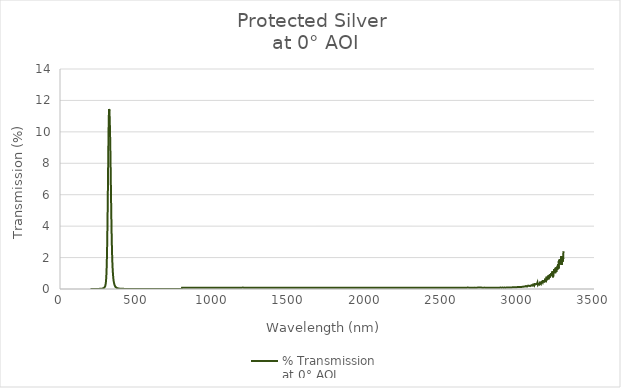
| Category | % Transmission 
at 0° AOI |
|---|---|
| 200.0 | 0 |
| 201.0 | 0 |
| 202.0 | 0.001 |
| 203.0 | 0.001 |
| 204.0 | 0.001 |
| 205.0 | 0.001 |
| 206.0 | 0.001 |
| 207.0 | 0.001 |
| 208.0 | 0.001 |
| 209.0 | 0.001 |
| 210.0 | 0.001 |
| 211.0 | 0.001 |
| 212.0 | 0.002 |
| 213.0 | 0.001 |
| 214.0 | 0.002 |
| 215.0 | 0.001 |
| 216.0 | 0.002 |
| 217.0 | 0.002 |
| 218.0 | 0.002 |
| 219.0 | 0.002 |
| 220.0 | 0.002 |
| 221.0 | 0.002 |
| 222.0 | 0.002 |
| 223.0 | 0.002 |
| 224.0 | 0.002 |
| 225.0 | 0.002 |
| 226.0 | 0.003 |
| 227.0 | 0.003 |
| 228.0 | 0.003 |
| 229.0 | 0.002 |
| 230.0 | 0.003 |
| 231.0 | 0.003 |
| 232.0 | 0.003 |
| 233.0 | 0.003 |
| 234.0 | 0.003 |
| 235.0 | 0.003 |
| 236.0 | 0.003 |
| 237.0 | 0.004 |
| 238.0 | 0.003 |
| 239.0 | 0.004 |
| 240.0 | 0.004 |
| 241.0 | 0.004 |
| 242.0 | 0.004 |
| 243.0 | 0.004 |
| 244.0 | 0.005 |
| 245.0 | 0.005 |
| 246.0 | 0.005 |
| 247.0 | 0.005 |
| 248.0 | 0.005 |
| 249.0 | 0.006 |
| 250.0 | 0.006 |
| 251.0 | 0.006 |
| 252.0 | 0.006 |
| 253.0 | 0.006 |
| 254.0 | 0.007 |
| 255.0 | 0.007 |
| 256.0 | 0.007 |
| 257.0 | 0.008 |
| 258.0 | 0.008 |
| 259.0 | 0.009 |
| 260.0 | 0.009 |
| 261.0 | 0.01 |
| 262.0 | 0.01 |
| 263.0 | 0.011 |
| 264.0 | 0.011 |
| 265.0 | 0.012 |
| 266.0 | 0.013 |
| 267.0 | 0.013 |
| 268.0 | 0.014 |
| 269.0 | 0.015 |
| 270.0 | 0.016 |
| 271.0 | 0.017 |
| 272.0 | 0.019 |
| 273.0 | 0.02 |
| 274.0 | 0.021 |
| 275.0 | 0.023 |
| 276.0 | 0.025 |
| 277.0 | 0.027 |
| 278.0 | 0.029 |
| 279.0 | 0.031 |
| 280.0 | 0.034 |
| 281.0 | 0.037 |
| 282.0 | 0.04 |
| 283.0 | 0.044 |
| 284.0 | 0.048 |
| 285.0 | 0.052 |
| 286.0 | 0.058 |
| 287.0 | 0.064 |
| 288.0 | 0.07 |
| 289.0 | 0.077 |
| 290.0 | 0.085 |
| 291.0 | 0.094 |
| 292.0 | 0.106 |
| 293.0 | 0.119 |
| 294.0 | 0.135 |
| 295.0 | 0.154 |
| 296.0 | 0.178 |
| 297.0 | 0.209 |
| 298.0 | 0.249 |
| 299.0 | 0.301 |
| 300.0 | 0.369 |
| 301.0 | 0.456 |
| 302.0 | 0.569 |
| 303.0 | 0.716 |
| 304.0 | 0.902 |
| 305.0 | 1.136 |
| 306.0 | 1.433 |
| 307.0 | 1.796 |
| 308.0 | 2.226 |
| 309.0 | 2.737 |
| 310.0 | 3.327 |
| 311.0 | 4.005 |
| 312.0 | 4.747 |
| 313.0 | 5.559 |
| 314.0 | 6.417 |
| 315.0 | 7.318 |
| 316.0 | 8.203 |
| 317.0 | 9.057 |
| 318.0 | 9.821 |
| 319.0 | 10.466 |
| 320.0 | 10.959 |
| 321.0 | 11.284 |
| 322.0 | 11.456 |
| 323.0 | 11.449 |
| 324.0 | 11.323 |
| 325.0 | 11.08 |
| 326.0 | 10.757 |
| 327.0 | 10.386 |
| 328.0 | 9.944 |
| 329.0 | 9.456 |
| 330.0 | 8.911 |
| 331.0 | 8.296 |
| 332.0 | 7.621 |
| 333.0 | 6.944 |
| 334.0 | 6.252 |
| 335.0 | 5.558 |
| 336.0 | 4.902 |
| 337.0 | 4.295 |
| 338.0 | 3.727 |
| 339.0 | 3.218 |
| 340.0 | 2.785 |
| 341.0 | 2.395 |
| 342.0 | 2.057 |
| 343.0 | 1.765 |
| 344.0 | 1.52 |
| 345.0 | 1.31 |
| 346.0 | 1.131 |
| 347.0 | 0.98 |
| 348.0 | 0.851 |
| 349.0 | 0.734 |
| 350.0 | 0.641 |
| 351.0 | 0.562 |
| 352.0 | 0.493 |
| 353.0 | 0.435 |
| 354.0 | 0.383 |
| 355.0 | 0.341 |
| 356.0 | 0.302 |
| 357.0 | 0.269 |
| 358.0 | 0.242 |
| 359.0 | 0.217 |
| 360.0 | 0.194 |
| 361.0 | 0.176 |
| 362.0 | 0.158 |
| 363.0 | 0.144 |
| 364.0 | 0.132 |
| 365.0 | 0.12 |
| 366.0 | 0.11 |
| 367.0 | 0.101 |
| 368.0 | 0.092 |
| 369.0 | 0.085 |
| 370.0 | 0.079 |
| 371.0 | 0.073 |
| 372.0 | 0.068 |
| 373.0 | 0.062 |
| 374.0 | 0.058 |
| 375.0 | 0.055 |
| 376.0 | 0.051 |
| 377.0 | 0.048 |
| 378.0 | 0.045 |
| 379.0 | 0.042 |
| 380.0 | 0.04 |
| 381.0 | 0.037 |
| 382.0 | 0.035 |
| 383.0 | 0.033 |
| 384.0 | 0.032 |
| 385.0 | 0.03 |
| 386.0 | 0.028 |
| 387.0 | 0.027 |
| 388.0 | 0.026 |
| 389.0 | 0.024 |
| 390.0 | 0.023 |
| 391.0 | 0.022 |
| 392.0 | 0.021 |
| 393.0 | 0.021 |
| 394.0 | 0.019 |
| 395.0 | 0.019 |
| 396.0 | 0.018 |
| 397.0 | 0.017 |
| 398.0 | 0.016 |
| 399.0 | 0.016 |
| 400.0 | 0.015 |
| 401.0 | 0.015 |
| 402.0 | 0.014 |
| 403.0 | 0.014 |
| 404.0 | 0.013 |
| 405.0 | 0.013 |
| 406.0 | 0.012 |
| 407.0 | 0.012 |
| 408.0 | 0.011 |
| 409.0 | 0.011 |
| 410.0 | 0.011 |
| 411.0 | 0.01 |
| 412.0 | 0.01 |
| 413.0 | 0.01 |
| 414.0 | 0.01 |
| 415.0 | 0.009 |
| 416.0 | 0.009 |
| 417.0 | 0.009 |
| 418.0 | 0.008 |
| 419.0 | 0.008 |
| 420.0 | 0.008 |
| 421.0 | 0.008 |
| 422.0 | 0.007 |
| 423.0 | 0.007 |
| 424.0 | 0.007 |
| 425.0 | 0.007 |
| 426.0 | 0.007 |
| 427.0 | 0.006 |
| 428.0 | 0.006 |
| 429.0 | 0.006 |
| 430.0 | 0.006 |
| 431.0 | 0.006 |
| 432.0 | 0.006 |
| 433.0 | 0.005 |
| 434.0 | 0.005 |
| 435.0 | 0.005 |
| 436.0 | 0.005 |
| 437.0 | 0.005 |
| 438.0 | 0.005 |
| 439.0 | 0.005 |
| 440.0 | 0.004 |
| 441.0 | 0.004 |
| 442.0 | 0.004 |
| 443.0 | 0.004 |
| 444.0 | 0.004 |
| 445.0 | 0.004 |
| 446.0 | 0.004 |
| 447.0 | 0.004 |
| 448.0 | 0.004 |
| 449.0 | 0.004 |
| 450.0 | 0.004 |
| 451.0 | 0.003 |
| 452.0 | 0.003 |
| 453.0 | 0.003 |
| 454.0 | 0.003 |
| 455.0 | 0.003 |
| 456.0 | 0.003 |
| 457.0 | 0.003 |
| 458.0 | 0.003 |
| 459.0 | 0.003 |
| 460.0 | 0.003 |
| 461.0 | 0.003 |
| 462.0 | 0.003 |
| 463.0 | 0.003 |
| 464.0 | 0.003 |
| 465.0 | 0.003 |
| 466.0 | 0.003 |
| 467.0 | 0.003 |
| 468.0 | 0.003 |
| 469.0 | 0.003 |
| 470.0 | 0.002 |
| 471.0 | 0.002 |
| 472.0 | 0.003 |
| 473.0 | 0.002 |
| 474.0 | 0.002 |
| 475.0 | 0.002 |
| 476.0 | 0.002 |
| 477.0 | 0.002 |
| 478.0 | 0.002 |
| 479.0 | 0.002 |
| 480.0 | 0.002 |
| 481.0 | 0.002 |
| 482.0 | 0.002 |
| 483.0 | 0.002 |
| 484.0 | 0.002 |
| 485.0 | 0.002 |
| 486.0 | 0.002 |
| 487.0 | 0.002 |
| 488.0 | 0.002 |
| 489.0 | 0.002 |
| 490.0 | 0.002 |
| 491.0 | 0.002 |
| 492.0 | 0.002 |
| 493.0 | 0.002 |
| 494.0 | 0.002 |
| 495.0 | 0.002 |
| 496.0 | 0.002 |
| 497.0 | 0.002 |
| 498.0 | 0.002 |
| 499.0 | 0.002 |
| 500.0 | 0.002 |
| 501.0 | 0.002 |
| 502.0 | 0.002 |
| 503.0 | 0.002 |
| 504.0 | 0.002 |
| 505.0 | 0.002 |
| 506.0 | 0.002 |
| 507.0 | 0.002 |
| 508.0 | 0.002 |
| 509.0 | 0.002 |
| 510.0 | 0.002 |
| 511.0 | 0.001 |
| 512.0 | 0.002 |
| 513.0 | 0.002 |
| 514.0 | 0.002 |
| 515.0 | 0.001 |
| 516.0 | 0.001 |
| 517.0 | 0.002 |
| 518.0 | 0.001 |
| 519.0 | 0.001 |
| 520.0 | 0.001 |
| 521.0 | 0.001 |
| 522.0 | 0.001 |
| 523.0 | 0.001 |
| 524.0 | 0.001 |
| 525.0 | 0.001 |
| 526.0 | 0.001 |
| 527.0 | 0.001 |
| 528.0 | 0.001 |
| 529.0 | 0.001 |
| 530.0 | 0.001 |
| 531.0 | 0.001 |
| 532.0 | 0.001 |
| 533.0 | 0.001 |
| 534.0 | 0.001 |
| 535.0 | 0.001 |
| 536.0 | 0.001 |
| 537.0 | 0.001 |
| 538.0 | 0.001 |
| 539.0 | 0.001 |
| 540.0 | 0.001 |
| 541.0 | 0.001 |
| 542.0 | 0.001 |
| 543.0 | 0.002 |
| 544.0 | 0.001 |
| 545.0 | 0.001 |
| 546.0 | 0.001 |
| 547.0 | 0.001 |
| 548.0 | 0.001 |
| 549.0 | 0.001 |
| 550.0 | 0.001 |
| 551.0 | 0.001 |
| 552.0 | 0.001 |
| 553.0 | 0.001 |
| 554.0 | 0.001 |
| 555.0 | 0.001 |
| 556.0 | 0.001 |
| 557.0 | 0.001 |
| 558.0 | 0.001 |
| 559.0 | 0.001 |
| 560.0 | 0.001 |
| 561.0 | 0.001 |
| 562.0 | 0.001 |
| 563.0 | 0.001 |
| 564.0 | 0.001 |
| 565.0 | 0.001 |
| 566.0 | 0.001 |
| 567.0 | 0.001 |
| 568.0 | 0.001 |
| 569.0 | 0.001 |
| 570.0 | 0.001 |
| 571.0 | 0.001 |
| 572.0 | 0.001 |
| 573.0 | 0.001 |
| 574.0 | 0.001 |
| 575.0 | 0.001 |
| 576.0 | 0.001 |
| 577.0 | 0.001 |
| 578.0 | 0.001 |
| 579.0 | 0.001 |
| 580.0 | 0.001 |
| 581.0 | 0.001 |
| 582.0 | 0.001 |
| 583.0 | 0.001 |
| 584.0 | 0.001 |
| 585.0 | 0.001 |
| 586.0 | 0.001 |
| 587.0 | 0.001 |
| 588.0 | 0.001 |
| 589.0 | 0.001 |
| 590.0 | 0.001 |
| 591.0 | 0.001 |
| 592.0 | 0.001 |
| 593.0 | 0.001 |
| 594.0 | 0.001 |
| 595.0 | 0.001 |
| 596.0 | 0 |
| 597.0 | 0.001 |
| 598.0 | 0 |
| 599.0 | 0.001 |
| 600.0 | 0.001 |
| 601.0 | 0.001 |
| 602.0 | 0 |
| 603.0 | 0.001 |
| 604.0 | 0.001 |
| 605.0 | 0.001 |
| 606.0 | 0.001 |
| 607.0 | 0.001 |
| 608.0 | 0.001 |
| 609.0 | 0.001 |
| 610.0 | 0.001 |
| 611.0 | 0.001 |
| 612.0 | 0.001 |
| 613.0 | 0.001 |
| 614.0 | 0.001 |
| 615.0 | 0.001 |
| 616.0 | 0.001 |
| 617.0 | 0.001 |
| 618.0 | 0.001 |
| 619.0 | 0.001 |
| 620.0 | 0.001 |
| 621.0 | 0.001 |
| 622.0 | 0.001 |
| 623.0 | 0.001 |
| 624.0 | 0.001 |
| 625.0 | 0.001 |
| 626.0 | 0.001 |
| 627.0 | 0.001 |
| 628.0 | 0.001 |
| 629.0 | 0.001 |
| 630.0 | 0.001 |
| 631.0 | 0.001 |
| 632.0 | 0.001 |
| 633.0 | 0.001 |
| 634.0 | 0 |
| 635.0 | 0 |
| 636.0 | 0.001 |
| 637.0 | 0 |
| 638.0 | 0 |
| 639.0 | 0.001 |
| 640.0 | 0.001 |
| 641.0 | 0.001 |
| 642.0 | 0.001 |
| 643.0 | 0 |
| 644.0 | 0 |
| 645.0 | 0.001 |
| 646.0 | 0.001 |
| 647.0 | 0.001 |
| 648.0 | 0 |
| 649.0 | 0.001 |
| 650.0 | 0.001 |
| 651.0 | 0.001 |
| 652.0 | 0.001 |
| 653.0 | 0.001 |
| 654.0 | 0.001 |
| 655.0 | 0.001 |
| 656.0 | 0.001 |
| 657.0 | 0.001 |
| 658.0 | 0.001 |
| 659.0 | 0.001 |
| 660.0 | 0.001 |
| 661.0 | 0.001 |
| 662.0 | 0.001 |
| 663.0 | 0.001 |
| 664.0 | 0 |
| 665.0 | 0.001 |
| 666.0 | 0.001 |
| 667.0 | 0.001 |
| 668.0 | 0.001 |
| 669.0 | 0.001 |
| 670.0 | 0 |
| 671.0 | 0.001 |
| 672.0 | 0.001 |
| 673.0 | 0.001 |
| 674.0 | 0.001 |
| 675.0 | 0.001 |
| 676.0 | 0 |
| 677.0 | 0.001 |
| 678.0 | 0.001 |
| 679.0 | 0.001 |
| 680.0 | 0.001 |
| 681.0 | 0.001 |
| 682.0 | 0 |
| 683.0 | 0.001 |
| 684.0 | 0.001 |
| 685.0 | 0.001 |
| 686.0 | 0.001 |
| 687.0 | 0.001 |
| 688.0 | 0.001 |
| 689.0 | 0.001 |
| 690.0 | 0.001 |
| 691.0 | 0.001 |
| 692.0 | 0.001 |
| 693.0 | 0.001 |
| 694.0 | 0.001 |
| 695.0 | 0.001 |
| 696.0 | 0.001 |
| 697.0 | 0.001 |
| 698.0 | 0.001 |
| 699.0 | 0.001 |
| 700.0 | 0.001 |
| 701.0 | 0.001 |
| 702.0 | 0.001 |
| 703.0 | 0.001 |
| 704.0 | 0.001 |
| 705.0 | 0.001 |
| 706.0 | 0.001 |
| 707.0 | 0.001 |
| 708.0 | 0.001 |
| 709.0 | 0.001 |
| 710.0 | 0.001 |
| 711.0 | 0.001 |
| 712.0 | 0.001 |
| 713.0 | 0.001 |
| 714.0 | 0.001 |
| 715.0 | 0.001 |
| 716.0 | 0.001 |
| 717.0 | 0.001 |
| 718.0 | 0.001 |
| 719.0 | 0.001 |
| 720.0 | 0.001 |
| 721.0 | 0.001 |
| 722.0 | 0.001 |
| 723.0 | 0.001 |
| 724.0 | 0.001 |
| 725.0 | 0.001 |
| 726.0 | 0.001 |
| 727.0 | 0.001 |
| 728.0 | 0.001 |
| 729.0 | 0.001 |
| 730.0 | 0.001 |
| 731.0 | 0.001 |
| 732.0 | 0.001 |
| 733.0 | 0.001 |
| 734.0 | 0.001 |
| 735.0 | 0.001 |
| 736.0 | 0.001 |
| 737.0 | 0.001 |
| 738.0 | 0.001 |
| 739.0 | 0.001 |
| 740.0 | 0.001 |
| 741.0 | 0.001 |
| 742.0 | 0.001 |
| 743.0 | 0.001 |
| 744.0 | 0.001 |
| 745.0 | 0.001 |
| 746.0 | 0.001 |
| 747.0 | 0.001 |
| 748.0 | 0.001 |
| 749.0 | 0.001 |
| 750.0 | 0.001 |
| 751.0 | 0.001 |
| 752.0 | 0.001 |
| 753.0 | 0.001 |
| 754.0 | 0.001 |
| 755.0 | 0.001 |
| 756.0 | 0.001 |
| 757.0 | 0.001 |
| 758.0 | 0.001 |
| 759.0 | 0.001 |
| 760.0 | 0.001 |
| 761.0 | 0.001 |
| 762.0 | 0.001 |
| 763.0 | 0.001 |
| 764.0 | 0.001 |
| 765.0 | 0.001 |
| 766.0 | 0.001 |
| 767.0 | 0.001 |
| 768.0 | 0.001 |
| 769.0 | 0.001 |
| 770.0 | 0.001 |
| 771.0 | 0.001 |
| 772.0 | 0.001 |
| 773.0 | 0.001 |
| 774.0 | 0.001 |
| 775.0 | 0.001 |
| 776.0 | 0.001 |
| 777.0 | 0.001 |
| 778.0 | 0.001 |
| 779.0 | 0.001 |
| 780.0 | 0.001 |
| 781.0 | 0.001 |
| 782.0 | 0.001 |
| 783.0 | 0.001 |
| 784.0 | 0.001 |
| 785.0 | 0.001 |
| 786.0 | 0.001 |
| 787.0 | 0.001 |
| 788.0 | 0.001 |
| 789.0 | 0.001 |
| 790.0 | 0.001 |
| 791.0 | 0.001 |
| 792.0 | 0.001 |
| 793.0 | 0.001 |
| 794.0 | 0.001 |
| 795.0 | 0.001 |
| 796.0 | 0.001 |
| 797.0 | 0.001 |
| 798.0 | 0.001 |
| 799.0 | 0 |
| 800.0 | 0.082 |
| 801.0 | 0.082 |
| 802.0 | 0.082 |
| 803.0 | 0.082 |
| 804.0 | 0.084 |
| 805.0 | 0.082 |
| 806.0 | 0.083 |
| 807.0 | 0.083 |
| 808.0 | 0.084 |
| 809.0 | 0.081 |
| 810.0 | 0.082 |
| 811.0 | 0.084 |
| 812.0 | 0.084 |
| 813.0 | 0.081 |
| 814.0 | 0.08 |
| 815.0 | 0.082 |
| 816.0 | 0.082 |
| 817.0 | 0.081 |
| 818.0 | 0.084 |
| 819.0 | 0.083 |
| 820.0 | 0.082 |
| 821.0 | 0.083 |
| 822.0 | 0.082 |
| 823.0 | 0.084 |
| 824.0 | 0.083 |
| 825.0 | 0.081 |
| 826.0 | 0.081 |
| 827.0 | 0.081 |
| 828.0 | 0.084 |
| 829.0 | 0.083 |
| 830.0 | 0.084 |
| 831.0 | 0.082 |
| 832.0 | 0.082 |
| 833.0 | 0.083 |
| 834.0 | 0.082 |
| 835.0 | 0.083 |
| 836.0 | 0.084 |
| 837.0 | 0.083 |
| 838.0 | 0.081 |
| 839.0 | 0.083 |
| 840.0 | 0.082 |
| 841.0 | 0.082 |
| 842.0 | 0.083 |
| 843.0 | 0.083 |
| 844.0 | 0.085 |
| 845.0 | 0.083 |
| 846.0 | 0.083 |
| 847.0 | 0.085 |
| 848.0 | 0.086 |
| 849.0 | 0.081 |
| 850.0 | 0.083 |
| 851.0 | 0.084 |
| 852.0 | 0.085 |
| 853.0 | 0.082 |
| 854.0 | 0.082 |
| 855.0 | 0.085 |
| 856.0 | 0.083 |
| 857.0 | 0.082 |
| 858.0 | 0.085 |
| 859.0 | 0.081 |
| 860.0 | 0.078 |
| 861.0 | 0.083 |
| 862.0 | 0.084 |
| 863.0 | 0.081 |
| 864.0 | 0.083 |
| 865.0 | 0.085 |
| 866.0 | 0.083 |
| 867.0 | 0.081 |
| 868.0 | 0.083 |
| 869.0 | 0.084 |
| 870.0 | 0.085 |
| 871.0 | 0.084 |
| 872.0 | 0.084 |
| 873.0 | 0.084 |
| 874.0 | 0.086 |
| 875.0 | 0.084 |
| 876.0 | 0.084 |
| 877.0 | 0.081 |
| 878.0 | 0.085 |
| 879.0 | 0.084 |
| 880.0 | 0.084 |
| 881.0 | 0.084 |
| 882.0 | 0.086 |
| 883.0 | 0.083 |
| 884.0 | 0.082 |
| 885.0 | 0.084 |
| 886.0 | 0.083 |
| 887.0 | 0.082 |
| 888.0 | 0.082 |
| 889.0 | 0.084 |
| 890.0 | 0.083 |
| 891.0 | 0.083 |
| 892.0 | 0.082 |
| 893.0 | 0.083 |
| 894.0 | 0.084 |
| 895.0 | 0.082 |
| 896.0 | 0.083 |
| 897.0 | 0.084 |
| 898.0 | 0.083 |
| 899.0 | 0.084 |
| 900.0 | 0.082 |
| 901.0 | 0.083 |
| 902.0 | 0.085 |
| 903.0 | 0.083 |
| 904.0 | 0.081 |
| 905.0 | 0.082 |
| 906.0 | 0.081 |
| 907.0 | 0.084 |
| 908.0 | 0.082 |
| 909.0 | 0.081 |
| 910.0 | 0.083 |
| 911.0 | 0.082 |
| 912.0 | 0.082 |
| 913.0 | 0.083 |
| 914.0 | 0.081 |
| 915.0 | 0.082 |
| 916.0 | 0.083 |
| 917.0 | 0.081 |
| 918.0 | 0.082 |
| 919.0 | 0.079 |
| 920.0 | 0.083 |
| 921.0 | 0.081 |
| 922.0 | 0.083 |
| 923.0 | 0.081 |
| 924.0 | 0.085 |
| 925.0 | 0.081 |
| 926.0 | 0.082 |
| 927.0 | 0.081 |
| 928.0 | 0.082 |
| 929.0 | 0.082 |
| 930.0 | 0.085 |
| 931.0 | 0.081 |
| 932.0 | 0.082 |
| 933.0 | 0.083 |
| 934.0 | 0.084 |
| 935.0 | 0.08 |
| 936.0 | 0.081 |
| 937.0 | 0.083 |
| 938.0 | 0.083 |
| 939.0 | 0.081 |
| 940.0 | 0.083 |
| 941.0 | 0.085 |
| 942.0 | 0.081 |
| 943.0 | 0.08 |
| 944.0 | 0.081 |
| 945.0 | 0.081 |
| 946.0 | 0.081 |
| 947.0 | 0.081 |
| 948.0 | 0.082 |
| 949.0 | 0.079 |
| 950.0 | 0.08 |
| 951.0 | 0.081 |
| 952.0 | 0.08 |
| 953.0 | 0.081 |
| 954.0 | 0.08 |
| 955.0 | 0.082 |
| 956.0 | 0.081 |
| 957.0 | 0.081 |
| 958.0 | 0.081 |
| 959.0 | 0.084 |
| 960.0 | 0.081 |
| 961.0 | 0.081 |
| 962.0 | 0.081 |
| 963.0 | 0.08 |
| 964.0 | 0.083 |
| 965.0 | 0.079 |
| 966.0 | 0.083 |
| 967.0 | 0.081 |
| 968.0 | 0.082 |
| 969.0 | 0.081 |
| 970.0 | 0.082 |
| 971.0 | 0.079 |
| 972.0 | 0.081 |
| 973.0 | 0.078 |
| 974.0 | 0.08 |
| 975.0 | 0.082 |
| 976.0 | 0.083 |
| 977.0 | 0.081 |
| 978.0 | 0.08 |
| 979.0 | 0.083 |
| 980.0 | 0.082 |
| 981.0 | 0.083 |
| 982.0 | 0.082 |
| 983.0 | 0.082 |
| 984.0 | 0.083 |
| 985.0 | 0.084 |
| 986.0 | 0.083 |
| 987.0 | 0.082 |
| 988.0 | 0.082 |
| 989.0 | 0.083 |
| 990.0 | 0.084 |
| 991.0 | 0.081 |
| 992.0 | 0.081 |
| 993.0 | 0.081 |
| 994.0 | 0.081 |
| 995.0 | 0.08 |
| 996.0 | 0.082 |
| 997.0 | 0.081 |
| 998.0 | 0.082 |
| 999.0 | 0.08 |
| 1000.0 | 0.078 |
| 1001.0 | 0.081 |
| 1002.0 | 0.081 |
| 1003.0 | 0.081 |
| 1004.0 | 0.082 |
| 1005.0 | 0.079 |
| 1006.0 | 0.083 |
| 1007.0 | 0.082 |
| 1008.0 | 0.083 |
| 1009.0 | 0.083 |
| 1010.0 | 0.082 |
| 1011.0 | 0.081 |
| 1012.0 | 0.082 |
| 1013.0 | 0.084 |
| 1014.0 | 0.083 |
| 1015.0 | 0.083 |
| 1016.0 | 0.082 |
| 1017.0 | 0.086 |
| 1018.0 | 0.082 |
| 1019.0 | 0.083 |
| 1020.0 | 0.08 |
| 1021.0 | 0.083 |
| 1022.0 | 0.084 |
| 1023.0 | 0.081 |
| 1024.0 | 0.081 |
| 1025.0 | 0.078 |
| 1026.0 | 0.082 |
| 1027.0 | 0.081 |
| 1028.0 | 0.081 |
| 1029.0 | 0.083 |
| 1030.0 | 0.082 |
| 1031.0 | 0.085 |
| 1032.0 | 0.083 |
| 1033.0 | 0.079 |
| 1034.0 | 0.083 |
| 1035.0 | 0.083 |
| 1036.0 | 0.08 |
| 1037.0 | 0.083 |
| 1038.0 | 0.082 |
| 1039.0 | 0.084 |
| 1040.0 | 0.082 |
| 1041.0 | 0.082 |
| 1042.0 | 0.082 |
| 1043.0 | 0.082 |
| 1044.0 | 0.082 |
| 1045.0 | 0.084 |
| 1046.0 | 0.082 |
| 1047.0 | 0.083 |
| 1048.0 | 0.081 |
| 1049.0 | 0.083 |
| 1050.0 | 0.082 |
| 1051.0 | 0.081 |
| 1052.0 | 0.081 |
| 1053.0 | 0.086 |
| 1054.0 | 0.082 |
| 1055.0 | 0.08 |
| 1056.0 | 0.083 |
| 1057.0 | 0.084 |
| 1058.0 | 0.08 |
| 1059.0 | 0.084 |
| 1060.0 | 0.081 |
| 1061.0 | 0.084 |
| 1062.0 | 0.08 |
| 1063.0 | 0.082 |
| 1064.0 | 0.078 |
| 1065.0 | 0.082 |
| 1066.0 | 0.081 |
| 1067.0 | 0.086 |
| 1068.0 | 0.084 |
| 1069.0 | 0.08 |
| 1070.0 | 0.082 |
| 1071.0 | 0.083 |
| 1072.0 | 0.079 |
| 1073.0 | 0.081 |
| 1074.0 | 0.082 |
| 1075.0 | 0.081 |
| 1076.0 | 0.083 |
| 1077.0 | 0.083 |
| 1078.0 | 0.082 |
| 1079.0 | 0.079 |
| 1080.0 | 0.081 |
| 1081.0 | 0.081 |
| 1082.0 | 0.082 |
| 1083.0 | 0.08 |
| 1084.0 | 0.081 |
| 1085.0 | 0.082 |
| 1086.0 | 0.08 |
| 1087.0 | 0.081 |
| 1088.0 | 0.082 |
| 1089.0 | 0.083 |
| 1090.0 | 0.079 |
| 1091.0 | 0.081 |
| 1092.0 | 0.084 |
| 1093.0 | 0.081 |
| 1094.0 | 0.081 |
| 1095.0 | 0.082 |
| 1096.0 | 0.081 |
| 1097.0 | 0.08 |
| 1098.0 | 0.082 |
| 1099.0 | 0.081 |
| 1100.0 | 0.081 |
| 1101.0 | 0.083 |
| 1102.0 | 0.085 |
| 1103.0 | 0.083 |
| 1104.0 | 0.082 |
| 1105.0 | 0.084 |
| 1106.0 | 0.079 |
| 1107.0 | 0.082 |
| 1108.0 | 0.08 |
| 1109.0 | 0.08 |
| 1110.0 | 0.083 |
| 1111.0 | 0.081 |
| 1112.0 | 0.083 |
| 1113.0 | 0.083 |
| 1114.0 | 0.083 |
| 1115.0 | 0.081 |
| 1116.0 | 0.082 |
| 1117.0 | 0.082 |
| 1118.0 | 0.082 |
| 1119.0 | 0.081 |
| 1120.0 | 0.081 |
| 1121.0 | 0.081 |
| 1122.0 | 0.08 |
| 1123.0 | 0.081 |
| 1124.0 | 0.082 |
| 1125.0 | 0.083 |
| 1126.0 | 0.082 |
| 1127.0 | 0.081 |
| 1128.0 | 0.083 |
| 1129.0 | 0.081 |
| 1130.0 | 0.083 |
| 1131.0 | 0.08 |
| 1132.0 | 0.078 |
| 1133.0 | 0.082 |
| 1134.0 | 0.083 |
| 1135.0 | 0.081 |
| 1136.0 | 0.083 |
| 1137.0 | 0.081 |
| 1138.0 | 0.082 |
| 1139.0 | 0.082 |
| 1140.0 | 0.082 |
| 1141.0 | 0.083 |
| 1142.0 | 0.082 |
| 1143.0 | 0.084 |
| 1144.0 | 0.082 |
| 1145.0 | 0.079 |
| 1146.0 | 0.082 |
| 1147.0 | 0.083 |
| 1148.0 | 0.081 |
| 1149.0 | 0.082 |
| 1150.0 | 0.08 |
| 1151.0 | 0.082 |
| 1152.0 | 0.082 |
| 1153.0 | 0.082 |
| 1154.0 | 0.082 |
| 1155.0 | 0.084 |
| 1156.0 | 0.082 |
| 1157.0 | 0.079 |
| 1158.0 | 0.082 |
| 1159.0 | 0.084 |
| 1160.0 | 0.081 |
| 1161.0 | 0.08 |
| 1162.0 | 0.081 |
| 1163.0 | 0.08 |
| 1164.0 | 0.082 |
| 1165.0 | 0.082 |
| 1166.0 | 0.083 |
| 1167.0 | 0.079 |
| 1168.0 | 0.083 |
| 1169.0 | 0.083 |
| 1170.0 | 0.08 |
| 1171.0 | 0.08 |
| 1172.0 | 0.081 |
| 1173.0 | 0.082 |
| 1174.0 | 0.08 |
| 1175.0 | 0.082 |
| 1176.0 | 0.079 |
| 1177.0 | 0.081 |
| 1178.0 | 0.086 |
| 1179.0 | 0.084 |
| 1180.0 | 0.081 |
| 1181.0 | 0.082 |
| 1182.0 | 0.082 |
| 1183.0 | 0.081 |
| 1184.0 | 0.081 |
| 1185.0 | 0.083 |
| 1186.0 | 0.083 |
| 1187.0 | 0.083 |
| 1188.0 | 0.081 |
| 1189.0 | 0.083 |
| 1190.0 | 0.082 |
| 1191.0 | 0.082 |
| 1192.0 | 0.086 |
| 1193.0 | 0.08 |
| 1194.0 | 0.082 |
| 1195.0 | 0.084 |
| 1196.0 | 0.085 |
| 1197.0 | 0.086 |
| 1198.0 | 0.085 |
| 1199.0 | 0.09 |
| 1200.0 | 0.081 |
| 1201.0 | 0.083 |
| 1202.0 | 0.081 |
| 1203.0 | 0.083 |
| 1204.0 | 0.083 |
| 1205.0 | 0.08 |
| 1206.0 | 0.083 |
| 1207.0 | 0.085 |
| 1208.0 | 0.083 |
| 1209.0 | 0.083 |
| 1210.0 | 0.083 |
| 1211.0 | 0.084 |
| 1212.0 | 0.081 |
| 1213.0 | 0.08 |
| 1214.0 | 0.08 |
| 1215.0 | 0.079 |
| 1216.0 | 0.081 |
| 1217.0 | 0.082 |
| 1218.0 | 0.082 |
| 1219.0 | 0.083 |
| 1220.0 | 0.083 |
| 1221.0 | 0.079 |
| 1222.0 | 0.08 |
| 1223.0 | 0.083 |
| 1224.0 | 0.083 |
| 1225.0 | 0.083 |
| 1226.0 | 0.083 |
| 1227.0 | 0.081 |
| 1228.0 | 0.081 |
| 1229.0 | 0.084 |
| 1230.0 | 0.08 |
| 1231.0 | 0.081 |
| 1232.0 | 0.082 |
| 1233.0 | 0.084 |
| 1234.0 | 0.083 |
| 1235.0 | 0.083 |
| 1236.0 | 0.083 |
| 1237.0 | 0.081 |
| 1238.0 | 0.083 |
| 1239.0 | 0.081 |
| 1240.0 | 0.081 |
| 1241.0 | 0.082 |
| 1242.0 | 0.082 |
| 1243.0 | 0.084 |
| 1244.0 | 0.081 |
| 1245.0 | 0.081 |
| 1246.0 | 0.083 |
| 1247.0 | 0.081 |
| 1248.0 | 0.083 |
| 1249.0 | 0.082 |
| 1250.0 | 0.082 |
| 1251.0 | 0.081 |
| 1252.0 | 0.082 |
| 1253.0 | 0.083 |
| 1254.0 | 0.083 |
| 1255.0 | 0.083 |
| 1256.0 | 0.082 |
| 1257.0 | 0.082 |
| 1258.0 | 0.081 |
| 1259.0 | 0.083 |
| 1260.0 | 0.082 |
| 1261.0 | 0.084 |
| 1262.0 | 0.082 |
| 1263.0 | 0.081 |
| 1264.0 | 0.084 |
| 1265.0 | 0.084 |
| 1266.0 | 0.08 |
| 1267.0 | 0.082 |
| 1268.0 | 0.082 |
| 1269.0 | 0.081 |
| 1270.0 | 0.082 |
| 1271.0 | 0.083 |
| 1272.0 | 0.083 |
| 1273.0 | 0.082 |
| 1274.0 | 0.084 |
| 1275.0 | 0.083 |
| 1276.0 | 0.08 |
| 1277.0 | 0.08 |
| 1278.0 | 0.083 |
| 1279.0 | 0.082 |
| 1280.0 | 0.081 |
| 1281.0 | 0.081 |
| 1282.0 | 0.082 |
| 1283.0 | 0.083 |
| 1284.0 | 0.084 |
| 1285.0 | 0.085 |
| 1286.0 | 0.084 |
| 1287.0 | 0.08 |
| 1288.0 | 0.082 |
| 1289.0 | 0.081 |
| 1290.0 | 0.082 |
| 1291.0 | 0.084 |
| 1292.0 | 0.082 |
| 1293.0 | 0.082 |
| 1294.0 | 0.084 |
| 1295.0 | 0.084 |
| 1296.0 | 0.083 |
| 1297.0 | 0.083 |
| 1298.0 | 0.081 |
| 1299.0 | 0.083 |
| 1300.0 | 0.083 |
| 1301.0 | 0.081 |
| 1302.0 | 0.082 |
| 1303.0 | 0.083 |
| 1304.0 | 0.08 |
| 1305.0 | 0.085 |
| 1306.0 | 0.083 |
| 1307.0 | 0.081 |
| 1308.0 | 0.083 |
| 1309.0 | 0.082 |
| 1310.0 | 0.083 |
| 1311.0 | 0.082 |
| 1312.0 | 0.08 |
| 1313.0 | 0.084 |
| 1314.0 | 0.081 |
| 1315.0 | 0.082 |
| 1316.0 | 0.083 |
| 1317.0 | 0.081 |
| 1318.0 | 0.082 |
| 1319.0 | 0.084 |
| 1320.0 | 0.08 |
| 1321.0 | 0.084 |
| 1322.0 | 0.082 |
| 1323.0 | 0.083 |
| 1324.0 | 0.081 |
| 1325.0 | 0.083 |
| 1326.0 | 0.083 |
| 1327.0 | 0.083 |
| 1328.0 | 0.081 |
| 1329.0 | 0.08 |
| 1330.0 | 0.081 |
| 1331.0 | 0.082 |
| 1332.0 | 0.081 |
| 1333.0 | 0.081 |
| 1334.0 | 0.085 |
| 1335.0 | 0.081 |
| 1336.0 | 0.083 |
| 1337.0 | 0.082 |
| 1338.0 | 0.085 |
| 1339.0 | 0.08 |
| 1340.0 | 0.081 |
| 1341.0 | 0.082 |
| 1342.0 | 0.082 |
| 1343.0 | 0.083 |
| 1344.0 | 0.083 |
| 1345.0 | 0.083 |
| 1346.0 | 0.082 |
| 1347.0 | 0.082 |
| 1348.0 | 0.084 |
| 1349.0 | 0.083 |
| 1350.0 | 0.081 |
| 1351.0 | 0.083 |
| 1352.0 | 0.082 |
| 1353.0 | 0.081 |
| 1354.0 | 0.081 |
| 1355.0 | 0.084 |
| 1356.0 | 0.08 |
| 1357.0 | 0.082 |
| 1358.0 | 0.083 |
| 1359.0 | 0.082 |
| 1360.0 | 0.081 |
| 1361.0 | 0.083 |
| 1362.0 | 0.083 |
| 1363.0 | 0.084 |
| 1364.0 | 0.082 |
| 1365.0 | 0.083 |
| 1366.0 | 0.082 |
| 1367.0 | 0.084 |
| 1368.0 | 0.084 |
| 1369.0 | 0.084 |
| 1370.0 | 0.084 |
| 1371.0 | 0.083 |
| 1372.0 | 0.08 |
| 1373.0 | 0.085 |
| 1374.0 | 0.082 |
| 1375.0 | 0.082 |
| 1376.0 | 0.08 |
| 1377.0 | 0.084 |
| 1378.0 | 0.082 |
| 1379.0 | 0.083 |
| 1380.0 | 0.081 |
| 1381.0 | 0.081 |
| 1382.0 | 0.083 |
| 1383.0 | 0.082 |
| 1384.0 | 0.08 |
| 1385.0 | 0.084 |
| 1386.0 | 0.081 |
| 1387.0 | 0.08 |
| 1388.0 | 0.083 |
| 1389.0 | 0.082 |
| 1390.0 | 0.081 |
| 1391.0 | 0.08 |
| 1392.0 | 0.081 |
| 1393.0 | 0.083 |
| 1394.0 | 0.079 |
| 1395.0 | 0.081 |
| 1396.0 | 0.082 |
| 1397.0 | 0.086 |
| 1398.0 | 0.082 |
| 1399.0 | 0.08 |
| 1400.0 | 0.083 |
| 1401.0 | 0.08 |
| 1402.0 | 0.082 |
| 1403.0 | 0.081 |
| 1404.0 | 0.081 |
| 1405.0 | 0.084 |
| 1406.0 | 0.082 |
| 1407.0 | 0.08 |
| 1408.0 | 0.081 |
| 1409.0 | 0.083 |
| 1410.0 | 0.084 |
| 1411.0 | 0.08 |
| 1412.0 | 0.082 |
| 1413.0 | 0.08 |
| 1414.0 | 0.08 |
| 1415.0 | 0.083 |
| 1416.0 | 0.084 |
| 1417.0 | 0.08 |
| 1418.0 | 0.082 |
| 1419.0 | 0.082 |
| 1420.0 | 0.083 |
| 1421.0 | 0.08 |
| 1422.0 | 0.083 |
| 1423.0 | 0.083 |
| 1424.0 | 0.083 |
| 1425.0 | 0.083 |
| 1426.0 | 0.081 |
| 1427.0 | 0.08 |
| 1428.0 | 0.081 |
| 1429.0 | 0.082 |
| 1430.0 | 0.082 |
| 1431.0 | 0.082 |
| 1432.0 | 0.082 |
| 1433.0 | 0.083 |
| 1434.0 | 0.08 |
| 1435.0 | 0.082 |
| 1436.0 | 0.08 |
| 1437.0 | 0.081 |
| 1438.0 | 0.084 |
| 1439.0 | 0.084 |
| 1440.0 | 0.082 |
| 1441.0 | 0.08 |
| 1442.0 | 0.083 |
| 1443.0 | 0.08 |
| 1444.0 | 0.081 |
| 1445.0 | 0.082 |
| 1446.0 | 0.083 |
| 1447.0 | 0.081 |
| 1448.0 | 0.08 |
| 1449.0 | 0.082 |
| 1450.0 | 0.082 |
| 1451.0 | 0.082 |
| 1452.0 | 0.082 |
| 1453.0 | 0.084 |
| 1454.0 | 0.08 |
| 1455.0 | 0.083 |
| 1456.0 | 0.08 |
| 1457.0 | 0.083 |
| 1458.0 | 0.082 |
| 1459.0 | 0.081 |
| 1460.0 | 0.083 |
| 1461.0 | 0.083 |
| 1462.0 | 0.081 |
| 1463.0 | 0.081 |
| 1464.0 | 0.085 |
| 1465.0 | 0.084 |
| 1466.0 | 0.08 |
| 1467.0 | 0.08 |
| 1468.0 | 0.083 |
| 1469.0 | 0.081 |
| 1470.0 | 0.084 |
| 1471.0 | 0.082 |
| 1472.0 | 0.082 |
| 1473.0 | 0.079 |
| 1474.0 | 0.081 |
| 1475.0 | 0.082 |
| 1476.0 | 0.082 |
| 1477.0 | 0.081 |
| 1478.0 | 0.081 |
| 1479.0 | 0.084 |
| 1480.0 | 0.081 |
| 1481.0 | 0.082 |
| 1482.0 | 0.079 |
| 1483.0 | 0.082 |
| 1484.0 | 0.083 |
| 1485.0 | 0.081 |
| 1486.0 | 0.084 |
| 1487.0 | 0.082 |
| 1488.0 | 0.081 |
| 1489.0 | 0.081 |
| 1490.0 | 0.083 |
| 1491.0 | 0.082 |
| 1492.0 | 0.082 |
| 1493.0 | 0.081 |
| 1494.0 | 0.08 |
| 1495.0 | 0.082 |
| 1496.0 | 0.083 |
| 1497.0 | 0.08 |
| 1498.0 | 0.078 |
| 1499.0 | 0.084 |
| 1500.0 | 0.082 |
| 1501.0 | 0.082 |
| 1502.0 | 0.082 |
| 1503.0 | 0.083 |
| 1504.0 | 0.083 |
| 1505.0 | 0.081 |
| 1506.0 | 0.082 |
| 1507.0 | 0.084 |
| 1508.0 | 0.081 |
| 1509.0 | 0.082 |
| 1510.0 | 0.08 |
| 1511.0 | 0.081 |
| 1512.0 | 0.08 |
| 1513.0 | 0.082 |
| 1514.0 | 0.079 |
| 1515.0 | 0.085 |
| 1516.0 | 0.081 |
| 1517.0 | 0.079 |
| 1518.0 | 0.08 |
| 1519.0 | 0.082 |
| 1520.0 | 0.081 |
| 1521.0 | 0.08 |
| 1522.0 | 0.082 |
| 1523.0 | 0.083 |
| 1524.0 | 0.079 |
| 1525.0 | 0.082 |
| 1526.0 | 0.082 |
| 1527.0 | 0.082 |
| 1528.0 | 0.082 |
| 1529.0 | 0.082 |
| 1530.0 | 0.081 |
| 1531.0 | 0.082 |
| 1532.0 | 0.083 |
| 1533.0 | 0.082 |
| 1534.0 | 0.079 |
| 1535.0 | 0.08 |
| 1536.0 | 0.083 |
| 1537.0 | 0.08 |
| 1538.0 | 0.08 |
| 1539.0 | 0.084 |
| 1540.0 | 0.08 |
| 1541.0 | 0.082 |
| 1542.0 | 0.083 |
| 1543.0 | 0.081 |
| 1544.0 | 0.083 |
| 1545.0 | 0.082 |
| 1546.0 | 0.084 |
| 1547.0 | 0.083 |
| 1548.0 | 0.083 |
| 1549.0 | 0.082 |
| 1550.0 | 0.083 |
| 1551.0 | 0.082 |
| 1552.0 | 0.083 |
| 1553.0 | 0.082 |
| 1554.0 | 0.081 |
| 1555.0 | 0.08 |
| 1556.0 | 0.082 |
| 1557.0 | 0.082 |
| 1558.0 | 0.082 |
| 1559.0 | 0.082 |
| 1560.0 | 0.082 |
| 1561.0 | 0.083 |
| 1562.0 | 0.083 |
| 1563.0 | 0.083 |
| 1564.0 | 0.08 |
| 1565.0 | 0.082 |
| 1566.0 | 0.083 |
| 1567.0 | 0.083 |
| 1568.0 | 0.082 |
| 1569.0 | 0.081 |
| 1570.0 | 0.082 |
| 1571.0 | 0.085 |
| 1572.0 | 0.083 |
| 1573.0 | 0.08 |
| 1574.0 | 0.078 |
| 1575.0 | 0.082 |
| 1576.0 | 0.082 |
| 1577.0 | 0.08 |
| 1578.0 | 0.08 |
| 1579.0 | 0.084 |
| 1580.0 | 0.082 |
| 1581.0 | 0.079 |
| 1582.0 | 0.08 |
| 1583.0 | 0.083 |
| 1584.0 | 0.083 |
| 1585.0 | 0.08 |
| 1586.0 | 0.082 |
| 1587.0 | 0.082 |
| 1588.0 | 0.084 |
| 1589.0 | 0.083 |
| 1590.0 | 0.081 |
| 1591.0 | 0.082 |
| 1592.0 | 0.08 |
| 1593.0 | 0.082 |
| 1594.0 | 0.082 |
| 1595.0 | 0.084 |
| 1596.0 | 0.082 |
| 1597.0 | 0.079 |
| 1598.0 | 0.082 |
| 1599.0 | 0.08 |
| 1600.0 | 0.082 |
| 1601.0 | 0.079 |
| 1602.0 | 0.085 |
| 1603.0 | 0.082 |
| 1604.0 | 0.083 |
| 1605.0 | 0.081 |
| 1606.0 | 0.083 |
| 1607.0 | 0.085 |
| 1608.0 | 0.082 |
| 1609.0 | 0.08 |
| 1610.0 | 0.082 |
| 1611.0 | 0.082 |
| 1612.0 | 0.083 |
| 1613.0 | 0.08 |
| 1614.0 | 0.083 |
| 1615.0 | 0.081 |
| 1616.0 | 0.08 |
| 1617.0 | 0.081 |
| 1618.0 | 0.082 |
| 1619.0 | 0.082 |
| 1620.0 | 0.083 |
| 1621.0 | 0.081 |
| 1622.0 | 0.082 |
| 1623.0 | 0.082 |
| 1624.0 | 0.081 |
| 1625.0 | 0.081 |
| 1626.0 | 0.082 |
| 1627.0 | 0.084 |
| 1628.0 | 0.081 |
| 1629.0 | 0.083 |
| 1630.0 | 0.082 |
| 1631.0 | 0.081 |
| 1632.0 | 0.085 |
| 1633.0 | 0.081 |
| 1634.0 | 0.081 |
| 1635.0 | 0.082 |
| 1636.0 | 0.081 |
| 1637.0 | 0.081 |
| 1638.0 | 0.081 |
| 1639.0 | 0.082 |
| 1640.0 | 0.081 |
| 1641.0 | 0.084 |
| 1642.0 | 0.084 |
| 1643.0 | 0.083 |
| 1644.0 | 0.084 |
| 1645.0 | 0.085 |
| 1646.0 | 0.081 |
| 1647.0 | 0.079 |
| 1648.0 | 0.083 |
| 1649.0 | 0.081 |
| 1650.0 | 0.083 |
| 1651.0 | 0.079 |
| 1652.0 | 0.081 |
| 1653.0 | 0.083 |
| 1654.0 | 0.083 |
| 1655.0 | 0.082 |
| 1656.0 | 0.082 |
| 1657.0 | 0.08 |
| 1658.0 | 0.081 |
| 1659.0 | 0.082 |
| 1660.0 | 0.081 |
| 1661.0 | 0.084 |
| 1662.0 | 0.083 |
| 1663.0 | 0.083 |
| 1664.0 | 0.081 |
| 1665.0 | 0.082 |
| 1666.0 | 0.085 |
| 1667.0 | 0.084 |
| 1668.0 | 0.082 |
| 1669.0 | 0.082 |
| 1670.0 | 0.081 |
| 1671.0 | 0.083 |
| 1672.0 | 0.082 |
| 1673.0 | 0.08 |
| 1674.0 | 0.083 |
| 1675.0 | 0.085 |
| 1676.0 | 0.083 |
| 1677.0 | 0.083 |
| 1678.0 | 0.084 |
| 1679.0 | 0.081 |
| 1680.0 | 0.083 |
| 1681.0 | 0.083 |
| 1682.0 | 0.084 |
| 1683.0 | 0.083 |
| 1684.0 | 0.084 |
| 1685.0 | 0.081 |
| 1686.0 | 0.081 |
| 1687.0 | 0.083 |
| 1688.0 | 0.082 |
| 1689.0 | 0.084 |
| 1690.0 | 0.082 |
| 1691.0 | 0.081 |
| 1692.0 | 0.082 |
| 1693.0 | 0.084 |
| 1694.0 | 0.083 |
| 1695.0 | 0.085 |
| 1696.0 | 0.083 |
| 1697.0 | 0.084 |
| 1698.0 | 0.083 |
| 1699.0 | 0.082 |
| 1700.0 | 0.082 |
| 1701.0 | 0.083 |
| 1702.0 | 0.083 |
| 1703.0 | 0.082 |
| 1704.0 | 0.084 |
| 1705.0 | 0.085 |
| 1706.0 | 0.082 |
| 1707.0 | 0.082 |
| 1708.0 | 0.084 |
| 1709.0 | 0.083 |
| 1710.0 | 0.083 |
| 1711.0 | 0.081 |
| 1712.0 | 0.082 |
| 1713.0 | 0.082 |
| 1714.0 | 0.084 |
| 1715.0 | 0.081 |
| 1716.0 | 0.083 |
| 1717.0 | 0.086 |
| 1718.0 | 0.081 |
| 1719.0 | 0.081 |
| 1720.0 | 0.081 |
| 1721.0 | 0.082 |
| 1722.0 | 0.083 |
| 1723.0 | 0.084 |
| 1724.0 | 0.083 |
| 1725.0 | 0.083 |
| 1726.0 | 0.082 |
| 1727.0 | 0.083 |
| 1728.0 | 0.083 |
| 1729.0 | 0.082 |
| 1730.0 | 0.082 |
| 1731.0 | 0.082 |
| 1732.0 | 0.08 |
| 1733.0 | 0.084 |
| 1734.0 | 0.087 |
| 1735.0 | 0.082 |
| 1736.0 | 0.081 |
| 1737.0 | 0.083 |
| 1738.0 | 0.08 |
| 1739.0 | 0.083 |
| 1740.0 | 0.083 |
| 1741.0 | 0.085 |
| 1742.0 | 0.082 |
| 1743.0 | 0.082 |
| 1744.0 | 0.084 |
| 1745.0 | 0.083 |
| 1746.0 | 0.082 |
| 1747.0 | 0.082 |
| 1748.0 | 0.085 |
| 1749.0 | 0.085 |
| 1750.0 | 0.082 |
| 1751.0 | 0.081 |
| 1752.0 | 0.081 |
| 1753.0 | 0.082 |
| 1754.0 | 0.082 |
| 1755.0 | 0.084 |
| 1756.0 | 0.083 |
| 1757.0 | 0.085 |
| 1758.0 | 0.081 |
| 1759.0 | 0.082 |
| 1760.0 | 0.084 |
| 1761.0 | 0.081 |
| 1762.0 | 0.084 |
| 1763.0 | 0.083 |
| 1764.0 | 0.083 |
| 1765.0 | 0.081 |
| 1766.0 | 0.085 |
| 1767.0 | 0.082 |
| 1768.0 | 0.082 |
| 1769.0 | 0.081 |
| 1770.0 | 0.083 |
| 1771.0 | 0.083 |
| 1772.0 | 0.081 |
| 1773.0 | 0.083 |
| 1774.0 | 0.082 |
| 1775.0 | 0.081 |
| 1776.0 | 0.084 |
| 1777.0 | 0.085 |
| 1778.0 | 0.083 |
| 1779.0 | 0.085 |
| 1780.0 | 0.083 |
| 1781.0 | 0.083 |
| 1782.0 | 0.082 |
| 1783.0 | 0.083 |
| 1784.0 | 0.083 |
| 1785.0 | 0.084 |
| 1786.0 | 0.084 |
| 1787.0 | 0.082 |
| 1788.0 | 0.084 |
| 1789.0 | 0.083 |
| 1790.0 | 0.08 |
| 1791.0 | 0.08 |
| 1792.0 | 0.083 |
| 1793.0 | 0.081 |
| 1794.0 | 0.084 |
| 1795.0 | 0.08 |
| 1796.0 | 0.082 |
| 1797.0 | 0.08 |
| 1798.0 | 0.082 |
| 1799.0 | 0.083 |
| 1800.0 | 0.084 |
| 1801.0 | 0.084 |
| 1802.0 | 0.083 |
| 1803.0 | 0.082 |
| 1804.0 | 0.082 |
| 1805.0 | 0.083 |
| 1806.0 | 0.081 |
| 1807.0 | 0.084 |
| 1808.0 | 0.084 |
| 1809.0 | 0.081 |
| 1810.0 | 0.082 |
| 1811.0 | 0.082 |
| 1812.0 | 0.083 |
| 1813.0 | 0.082 |
| 1814.0 | 0.082 |
| 1815.0 | 0.081 |
| 1816.0 | 0.082 |
| 1817.0 | 0.08 |
| 1818.0 | 0.082 |
| 1819.0 | 0.082 |
| 1820.0 | 0.082 |
| 1821.0 | 0.082 |
| 1822.0 | 0.083 |
| 1823.0 | 0.081 |
| 1824.0 | 0.082 |
| 1825.0 | 0.082 |
| 1826.0 | 0.08 |
| 1827.0 | 0.084 |
| 1828.0 | 0.081 |
| 1829.0 | 0.081 |
| 1830.0 | 0.081 |
| 1831.0 | 0.084 |
| 1832.0 | 0.082 |
| 1833.0 | 0.082 |
| 1834.0 | 0.082 |
| 1835.0 | 0.084 |
| 1836.0 | 0.082 |
| 1837.0 | 0.081 |
| 1838.0 | 0.083 |
| 1839.0 | 0.081 |
| 1840.0 | 0.082 |
| 1841.0 | 0.083 |
| 1842.0 | 0.085 |
| 1843.0 | 0.084 |
| 1844.0 | 0.081 |
| 1845.0 | 0.082 |
| 1846.0 | 0.083 |
| 1847.0 | 0.082 |
| 1848.0 | 0.081 |
| 1849.0 | 0.082 |
| 1850.0 | 0.081 |
| 1851.0 | 0.081 |
| 1852.0 | 0.08 |
| 1853.0 | 0.083 |
| 1854.0 | 0.081 |
| 1855.0 | 0.081 |
| 1856.0 | 0.081 |
| 1857.0 | 0.081 |
| 1858.0 | 0.083 |
| 1859.0 | 0.085 |
| 1860.0 | 0.082 |
| 1861.0 | 0.079 |
| 1862.0 | 0.082 |
| 1863.0 | 0.081 |
| 1864.0 | 0.082 |
| 1865.0 | 0.08 |
| 1866.0 | 0.082 |
| 1867.0 | 0.083 |
| 1868.0 | 0.082 |
| 1869.0 | 0.08 |
| 1870.0 | 0.081 |
| 1871.0 | 0.081 |
| 1872.0 | 0.082 |
| 1873.0 | 0.083 |
| 1874.0 | 0.082 |
| 1875.0 | 0.08 |
| 1876.0 | 0.081 |
| 1877.0 | 0.082 |
| 1878.0 | 0.084 |
| 1879.0 | 0.085 |
| 1880.0 | 0.085 |
| 1881.0 | 0.083 |
| 1882.0 | 0.082 |
| 1883.0 | 0.081 |
| 1884.0 | 0.083 |
| 1885.0 | 0.083 |
| 1886.0 | 0.081 |
| 1887.0 | 0.082 |
| 1888.0 | 0.081 |
| 1889.0 | 0.082 |
| 1890.0 | 0.081 |
| 1891.0 | 0.084 |
| 1892.0 | 0.083 |
| 1893.0 | 0.083 |
| 1894.0 | 0.081 |
| 1895.0 | 0.084 |
| 1896.0 | 0.082 |
| 1897.0 | 0.082 |
| 1898.0 | 0.084 |
| 1899.0 | 0.079 |
| 1900.0 | 0.081 |
| 1901.0 | 0.081 |
| 1902.0 | 0.082 |
| 1903.0 | 0.082 |
| 1904.0 | 0.081 |
| 1905.0 | 0.08 |
| 1906.0 | 0.084 |
| 1907.0 | 0.082 |
| 1908.0 | 0.08 |
| 1909.0 | 0.083 |
| 1910.0 | 0.08 |
| 1911.0 | 0.08 |
| 1912.0 | 0.081 |
| 1913.0 | 0.084 |
| 1914.0 | 0.081 |
| 1915.0 | 0.079 |
| 1916.0 | 0.082 |
| 1917.0 | 0.082 |
| 1918.0 | 0.079 |
| 1919.0 | 0.082 |
| 1920.0 | 0.082 |
| 1921.0 | 0.08 |
| 1922.0 | 0.079 |
| 1923.0 | 0.08 |
| 1924.0 | 0.083 |
| 1925.0 | 0.08 |
| 1926.0 | 0.08 |
| 1927.0 | 0.08 |
| 1928.0 | 0.083 |
| 1929.0 | 0.083 |
| 1930.0 | 0.083 |
| 1931.0 | 0.081 |
| 1932.0 | 0.08 |
| 1933.0 | 0.083 |
| 1934.0 | 0.081 |
| 1935.0 | 0.08 |
| 1936.0 | 0.082 |
| 1937.0 | 0.079 |
| 1938.0 | 0.082 |
| 1939.0 | 0.079 |
| 1940.0 | 0.081 |
| 1941.0 | 0.082 |
| 1942.0 | 0.081 |
| 1943.0 | 0.079 |
| 1944.0 | 0.081 |
| 1945.0 | 0.081 |
| 1946.0 | 0.081 |
| 1947.0 | 0.082 |
| 1948.0 | 0.083 |
| 1949.0 | 0.082 |
| 1950.0 | 0.08 |
| 1951.0 | 0.082 |
| 1952.0 | 0.08 |
| 1953.0 | 0.082 |
| 1954.0 | 0.081 |
| 1955.0 | 0.081 |
| 1956.0 | 0.081 |
| 1957.0 | 0.081 |
| 1958.0 | 0.083 |
| 1959.0 | 0.084 |
| 1960.0 | 0.081 |
| 1961.0 | 0.082 |
| 1962.0 | 0.081 |
| 1963.0 | 0.082 |
| 1964.0 | 0.081 |
| 1965.0 | 0.081 |
| 1966.0 | 0.081 |
| 1967.0 | 0.08 |
| 1968.0 | 0.08 |
| 1969.0 | 0.078 |
| 1970.0 | 0.08 |
| 1971.0 | 0.08 |
| 1972.0 | 0.08 |
| 1973.0 | 0.083 |
| 1974.0 | 0.079 |
| 1975.0 | 0.081 |
| 1976.0 | 0.082 |
| 1977.0 | 0.083 |
| 1978.0 | 0.081 |
| 1979.0 | 0.081 |
| 1980.0 | 0.08 |
| 1981.0 | 0.083 |
| 1982.0 | 0.079 |
| 1983.0 | 0.082 |
| 1984.0 | 0.082 |
| 1985.0 | 0.082 |
| 1986.0 | 0.08 |
| 1987.0 | 0.08 |
| 1988.0 | 0.08 |
| 1989.0 | 0.083 |
| 1990.0 | 0.08 |
| 1991.0 | 0.083 |
| 1992.0 | 0.081 |
| 1993.0 | 0.081 |
| 1994.0 | 0.081 |
| 1995.0 | 0.081 |
| 1996.0 | 0.081 |
| 1997.0 | 0.081 |
| 1998.0 | 0.08 |
| 1999.0 | 0.084 |
| 2000.0 | 0.081 |
| 2001.0 | 0.079 |
| 2002.0 | 0.08 |
| 2003.0 | 0.083 |
| 2004.0 | 0.08 |
| 2005.0 | 0.083 |
| 2006.0 | 0.081 |
| 2007.0 | 0.08 |
| 2008.0 | 0.08 |
| 2009.0 | 0.079 |
| 2010.0 | 0.079 |
| 2011.0 | 0.079 |
| 2012.0 | 0.079 |
| 2013.0 | 0.077 |
| 2014.0 | 0.081 |
| 2015.0 | 0.081 |
| 2016.0 | 0.08 |
| 2017.0 | 0.08 |
| 2018.0 | 0.081 |
| 2019.0 | 0.081 |
| 2020.0 | 0.077 |
| 2021.0 | 0.082 |
| 2022.0 | 0.081 |
| 2023.0 | 0.082 |
| 2024.0 | 0.079 |
| 2025.0 | 0.08 |
| 2026.0 | 0.081 |
| 2027.0 | 0.079 |
| 2028.0 | 0.08 |
| 2029.0 | 0.082 |
| 2030.0 | 0.08 |
| 2031.0 | 0.079 |
| 2032.0 | 0.081 |
| 2033.0 | 0.079 |
| 2034.0 | 0.081 |
| 2035.0 | 0.078 |
| 2036.0 | 0.079 |
| 2037.0 | 0.081 |
| 2038.0 | 0.077 |
| 2039.0 | 0.08 |
| 2040.0 | 0.079 |
| 2041.0 | 0.08 |
| 2042.0 | 0.079 |
| 2043.0 | 0.079 |
| 2044.0 | 0.08 |
| 2045.0 | 0.081 |
| 2046.0 | 0.08 |
| 2047.0 | 0.08 |
| 2048.0 | 0.079 |
| 2049.0 | 0.08 |
| 2050.0 | 0.078 |
| 2051.0 | 0.079 |
| 2052.0 | 0.079 |
| 2053.0 | 0.081 |
| 2054.0 | 0.078 |
| 2055.0 | 0.08 |
| 2056.0 | 0.08 |
| 2057.0 | 0.077 |
| 2058.0 | 0.079 |
| 2059.0 | 0.081 |
| 2060.0 | 0.082 |
| 2061.0 | 0.079 |
| 2062.0 | 0.079 |
| 2063.0 | 0.083 |
| 2064.0 | 0.079 |
| 2065.0 | 0.081 |
| 2066.0 | 0.082 |
| 2067.0 | 0.081 |
| 2068.0 | 0.08 |
| 2069.0 | 0.081 |
| 2070.0 | 0.079 |
| 2071.0 | 0.08 |
| 2072.0 | 0.081 |
| 2073.0 | 0.082 |
| 2074.0 | 0.078 |
| 2075.0 | 0.079 |
| 2076.0 | 0.081 |
| 2077.0 | 0.082 |
| 2078.0 | 0.08 |
| 2079.0 | 0.078 |
| 2080.0 | 0.079 |
| 2081.0 | 0.08 |
| 2082.0 | 0.081 |
| 2083.0 | 0.081 |
| 2084.0 | 0.08 |
| 2085.0 | 0.078 |
| 2086.0 | 0.081 |
| 2087.0 | 0.079 |
| 2088.0 | 0.083 |
| 2089.0 | 0.078 |
| 2090.0 | 0.078 |
| 2091.0 | 0.078 |
| 2092.0 | 0.078 |
| 2093.0 | 0.08 |
| 2094.0 | 0.077 |
| 2095.0 | 0.08 |
| 2096.0 | 0.079 |
| 2097.0 | 0.078 |
| 2098.0 | 0.081 |
| 2099.0 | 0.079 |
| 2100.0 | 0.077 |
| 2101.0 | 0.079 |
| 2102.0 | 0.079 |
| 2103.0 | 0.078 |
| 2104.0 | 0.08 |
| 2105.0 | 0.079 |
| 2106.0 | 0.079 |
| 2107.0 | 0.08 |
| 2108.0 | 0.078 |
| 2109.0 | 0.08 |
| 2110.0 | 0.08 |
| 2111.0 | 0.077 |
| 2112.0 | 0.08 |
| 2113.0 | 0.082 |
| 2114.0 | 0.077 |
| 2115.0 | 0.079 |
| 2116.0 | 0.079 |
| 2117.0 | 0.08 |
| 2118.0 | 0.079 |
| 2119.0 | 0.079 |
| 2120.0 | 0.078 |
| 2121.0 | 0.077 |
| 2122.0 | 0.077 |
| 2123.0 | 0.08 |
| 2124.0 | 0.078 |
| 2125.0 | 0.079 |
| 2126.0 | 0.078 |
| 2127.0 | 0.078 |
| 2128.0 | 0.078 |
| 2129.0 | 0.079 |
| 2130.0 | 0.08 |
| 2131.0 | 0.081 |
| 2132.0 | 0.079 |
| 2133.0 | 0.079 |
| 2134.0 | 0.08 |
| 2135.0 | 0.079 |
| 2136.0 | 0.076 |
| 2137.0 | 0.079 |
| 2138.0 | 0.078 |
| 2139.0 | 0.078 |
| 2140.0 | 0.08 |
| 2141.0 | 0.081 |
| 2142.0 | 0.077 |
| 2143.0 | 0.078 |
| 2144.0 | 0.08 |
| 2145.0 | 0.078 |
| 2146.0 | 0.081 |
| 2147.0 | 0.079 |
| 2148.0 | 0.078 |
| 2149.0 | 0.078 |
| 2150.0 | 0.079 |
| 2151.0 | 0.077 |
| 2152.0 | 0.08 |
| 2153.0 | 0.08 |
| 2154.0 | 0.077 |
| 2155.0 | 0.08 |
| 2156.0 | 0.077 |
| 2157.0 | 0.078 |
| 2158.0 | 0.076 |
| 2159.0 | 0.078 |
| 2160.0 | 0.078 |
| 2161.0 | 0.08 |
| 2162.0 | 0.078 |
| 2163.0 | 0.079 |
| 2164.0 | 0.077 |
| 2165.0 | 0.078 |
| 2166.0 | 0.078 |
| 2167.0 | 0.078 |
| 2168.0 | 0.08 |
| 2169.0 | 0.08 |
| 2170.0 | 0.079 |
| 2171.0 | 0.079 |
| 2172.0 | 0.079 |
| 2173.0 | 0.078 |
| 2174.0 | 0.078 |
| 2175.0 | 0.08 |
| 2176.0 | 0.078 |
| 2177.0 | 0.079 |
| 2178.0 | 0.077 |
| 2179.0 | 0.078 |
| 2180.0 | 0.079 |
| 2181.0 | 0.077 |
| 2182.0 | 0.077 |
| 2183.0 | 0.078 |
| 2184.0 | 0.077 |
| 2185.0 | 0.079 |
| 2186.0 | 0.078 |
| 2187.0 | 0.078 |
| 2188.0 | 0.078 |
| 2189.0 | 0.077 |
| 2190.0 | 0.078 |
| 2191.0 | 0.076 |
| 2192.0 | 0.073 |
| 2193.0 | 0.079 |
| 2194.0 | 0.077 |
| 2195.0 | 0.076 |
| 2196.0 | 0.077 |
| 2197.0 | 0.076 |
| 2198.0 | 0.078 |
| 2199.0 | 0.076 |
| 2200.0 | 0.079 |
| 2201.0 | 0.077 |
| 2202.0 | 0.076 |
| 2203.0 | 0.077 |
| 2204.0 | 0.078 |
| 2205.0 | 0.077 |
| 2206.0 | 0.079 |
| 2207.0 | 0.075 |
| 2208.0 | 0.079 |
| 2209.0 | 0.076 |
| 2210.0 | 0.078 |
| 2211.0 | 0.076 |
| 2212.0 | 0.076 |
| 2213.0 | 0.077 |
| 2214.0 | 0.081 |
| 2215.0 | 0.079 |
| 2216.0 | 0.076 |
| 2217.0 | 0.078 |
| 2218.0 | 0.078 |
| 2219.0 | 0.076 |
| 2220.0 | 0.077 |
| 2221.0 | 0.079 |
| 2222.0 | 0.079 |
| 2223.0 | 0.077 |
| 2224.0 | 0.079 |
| 2225.0 | 0.08 |
| 2226.0 | 0.077 |
| 2227.0 | 0.078 |
| 2228.0 | 0.076 |
| 2229.0 | 0.078 |
| 2230.0 | 0.078 |
| 2231.0 | 0.076 |
| 2232.0 | 0.078 |
| 2233.0 | 0.075 |
| 2234.0 | 0.078 |
| 2235.0 | 0.078 |
| 2236.0 | 0.078 |
| 2237.0 | 0.077 |
| 2238.0 | 0.077 |
| 2239.0 | 0.08 |
| 2240.0 | 0.077 |
| 2241.0 | 0.078 |
| 2242.0 | 0.078 |
| 2243.0 | 0.078 |
| 2244.0 | 0.079 |
| 2245.0 | 0.076 |
| 2246.0 | 0.079 |
| 2247.0 | 0.077 |
| 2248.0 | 0.078 |
| 2249.0 | 0.078 |
| 2250.0 | 0.077 |
| 2251.0 | 0.078 |
| 2252.0 | 0.078 |
| 2253.0 | 0.08 |
| 2254.0 | 0.078 |
| 2255.0 | 0.078 |
| 2256.0 | 0.078 |
| 2257.0 | 0.079 |
| 2258.0 | 0.077 |
| 2259.0 | 0.08 |
| 2260.0 | 0.081 |
| 2261.0 | 0.077 |
| 2262.0 | 0.078 |
| 2263.0 | 0.078 |
| 2264.0 | 0.077 |
| 2265.0 | 0.08 |
| 2266.0 | 0.08 |
| 2267.0 | 0.082 |
| 2268.0 | 0.077 |
| 2269.0 | 0.079 |
| 2270.0 | 0.08 |
| 2271.0 | 0.08 |
| 2272.0 | 0.079 |
| 2273.0 | 0.079 |
| 2274.0 | 0.079 |
| 2275.0 | 0.08 |
| 2276.0 | 0.079 |
| 2277.0 | 0.08 |
| 2278.0 | 0.079 |
| 2279.0 | 0.078 |
| 2280.0 | 0.078 |
| 2281.0 | 0.077 |
| 2282.0 | 0.078 |
| 2283.0 | 0.077 |
| 2284.0 | 0.079 |
| 2285.0 | 0.081 |
| 2286.0 | 0.078 |
| 2287.0 | 0.079 |
| 2288.0 | 0.08 |
| 2289.0 | 0.078 |
| 2290.0 | 0.077 |
| 2291.0 | 0.077 |
| 2292.0 | 0.079 |
| 2293.0 | 0.078 |
| 2294.0 | 0.077 |
| 2295.0 | 0.076 |
| 2296.0 | 0.076 |
| 2297.0 | 0.079 |
| 2298.0 | 0.078 |
| 2299.0 | 0.078 |
| 2300.0 | 0.077 |
| 2301.0 | 0.079 |
| 2302.0 | 0.078 |
| 2303.0 | 0.077 |
| 2304.0 | 0.076 |
| 2305.0 | 0.077 |
| 2306.0 | 0.078 |
| 2307.0 | 0.078 |
| 2308.0 | 0.078 |
| 2309.0 | 0.076 |
| 2310.0 | 0.076 |
| 2311.0 | 0.073 |
| 2312.0 | 0.076 |
| 2313.0 | 0.077 |
| 2314.0 | 0.077 |
| 2315.0 | 0.075 |
| 2316.0 | 0.076 |
| 2317.0 | 0.077 |
| 2318.0 | 0.077 |
| 2319.0 | 0.077 |
| 2320.0 | 0.078 |
| 2321.0 | 0.078 |
| 2322.0 | 0.078 |
| 2323.0 | 0.077 |
| 2324.0 | 0.076 |
| 2325.0 | 0.078 |
| 2326.0 | 0.076 |
| 2327.0 | 0.077 |
| 2328.0 | 0.076 |
| 2329.0 | 0.073 |
| 2330.0 | 0.078 |
| 2331.0 | 0.076 |
| 2332.0 | 0.075 |
| 2333.0 | 0.075 |
| 2334.0 | 0.076 |
| 2335.0 | 0.076 |
| 2336.0 | 0.074 |
| 2337.0 | 0.075 |
| 2338.0 | 0.077 |
| 2339.0 | 0.077 |
| 2340.0 | 0.076 |
| 2341.0 | 0.075 |
| 2342.0 | 0.075 |
| 2343.0 | 0.075 |
| 2344.0 | 0.076 |
| 2345.0 | 0.075 |
| 2346.0 | 0.076 |
| 2347.0 | 0.076 |
| 2348.0 | 0.073 |
| 2349.0 | 0.077 |
| 2350.0 | 0.077 |
| 2351.0 | 0.076 |
| 2352.0 | 0.076 |
| 2353.0 | 0.076 |
| 2354.0 | 0.077 |
| 2355.0 | 0.074 |
| 2356.0 | 0.078 |
| 2357.0 | 0.076 |
| 2358.0 | 0.075 |
| 2359.0 | 0.075 |
| 2360.0 | 0.078 |
| 2361.0 | 0.077 |
| 2362.0 | 0.077 |
| 2363.0 | 0.078 |
| 2364.0 | 0.076 |
| 2365.0 | 0.079 |
| 2366.0 | 0.077 |
| 2367.0 | 0.075 |
| 2368.0 | 0.078 |
| 2369.0 | 0.077 |
| 2370.0 | 0.077 |
| 2371.0 | 0.077 |
| 2372.0 | 0.077 |
| 2373.0 | 0.076 |
| 2374.0 | 0.076 |
| 2375.0 | 0.076 |
| 2376.0 | 0.077 |
| 2377.0 | 0.078 |
| 2378.0 | 0.077 |
| 2379.0 | 0.076 |
| 2380.0 | 0.078 |
| 2381.0 | 0.077 |
| 2382.0 | 0.077 |
| 2383.0 | 0.076 |
| 2384.0 | 0.078 |
| 2385.0 | 0.077 |
| 2386.0 | 0.078 |
| 2387.0 | 0.077 |
| 2388.0 | 0.077 |
| 2389.0 | 0.078 |
| 2390.0 | 0.075 |
| 2391.0 | 0.075 |
| 2392.0 | 0.078 |
| 2393.0 | 0.075 |
| 2394.0 | 0.076 |
| 2395.0 | 0.075 |
| 2396.0 | 0.077 |
| 2397.0 | 0.078 |
| 2398.0 | 0.078 |
| 2399.0 | 0.075 |
| 2400.0 | 0.076 |
| 2401.0 | 0.075 |
| 2402.0 | 0.078 |
| 2403.0 | 0.076 |
| 2404.0 | 0.076 |
| 2405.0 | 0.076 |
| 2406.0 | 0.078 |
| 2407.0 | 0.075 |
| 2408.0 | 0.077 |
| 2409.0 | 0.077 |
| 2410.0 | 0.077 |
| 2411.0 | 0.075 |
| 2412.0 | 0.076 |
| 2413.0 | 0.075 |
| 2414.0 | 0.075 |
| 2415.0 | 0.076 |
| 2416.0 | 0.075 |
| 2417.0 | 0.075 |
| 2418.0 | 0.077 |
| 2419.0 | 0.077 |
| 2420.0 | 0.078 |
| 2421.0 | 0.079 |
| 2422.0 | 0.077 |
| 2423.0 | 0.076 |
| 2424.0 | 0.077 |
| 2425.0 | 0.077 |
| 2426.0 | 0.075 |
| 2427.0 | 0.076 |
| 2428.0 | 0.076 |
| 2429.0 | 0.077 |
| 2430.0 | 0.077 |
| 2431.0 | 0.076 |
| 2432.0 | 0.079 |
| 2433.0 | 0.076 |
| 2434.0 | 0.073 |
| 2435.0 | 0.077 |
| 2436.0 | 0.076 |
| 2437.0 | 0.075 |
| 2438.0 | 0.077 |
| 2439.0 | 0.076 |
| 2440.0 | 0.075 |
| 2441.0 | 0.075 |
| 2442.0 | 0.077 |
| 2443.0 | 0.077 |
| 2444.0 | 0.074 |
| 2445.0 | 0.079 |
| 2446.0 | 0.076 |
| 2447.0 | 0.077 |
| 2448.0 | 0.075 |
| 2449.0 | 0.075 |
| 2450.0 | 0.077 |
| 2451.0 | 0.077 |
| 2452.0 | 0.077 |
| 2453.0 | 0.077 |
| 2454.0 | 0.078 |
| 2455.0 | 0.079 |
| 2456.0 | 0.077 |
| 2457.0 | 0.076 |
| 2458.0 | 0.075 |
| 2459.0 | 0.076 |
| 2460.0 | 0.077 |
| 2461.0 | 0.076 |
| 2462.0 | 0.075 |
| 2463.0 | 0.075 |
| 2464.0 | 0.08 |
| 2465.0 | 0.075 |
| 2466.0 | 0.077 |
| 2467.0 | 0.075 |
| 2468.0 | 0.077 |
| 2469.0 | 0.079 |
| 2470.0 | 0.076 |
| 2471.0 | 0.077 |
| 2472.0 | 0.076 |
| 2473.0 | 0.077 |
| 2474.0 | 0.076 |
| 2475.0 | 0.077 |
| 2476.0 | 0.08 |
| 2477.0 | 0.077 |
| 2478.0 | 0.078 |
| 2479.0 | 0.077 |
| 2480.0 | 0.078 |
| 2481.0 | 0.079 |
| 2482.0 | 0.075 |
| 2483.0 | 0.079 |
| 2484.0 | 0.076 |
| 2485.0 | 0.079 |
| 2486.0 | 0.077 |
| 2487.0 | 0.076 |
| 2488.0 | 0.076 |
| 2489.0 | 0.078 |
| 2490.0 | 0.076 |
| 2491.0 | 0.081 |
| 2492.0 | 0.078 |
| 2493.0 | 0.077 |
| 2494.0 | 0.076 |
| 2495.0 | 0.076 |
| 2496.0 | 0.076 |
| 2497.0 | 0.077 |
| 2498.0 | 0.078 |
| 2499.0 | 0.078 |
| 2500.0 | 0.076 |
| 2501.0 | 0.075 |
| 2502.0 | 0.076 |
| 2503.0 | 0.077 |
| 2504.0 | 0.077 |
| 2505.0 | 0.079 |
| 2506.0 | 0.076 |
| 2507.0 | 0.076 |
| 2508.0 | 0.077 |
| 2509.0 | 0.076 |
| 2510.0 | 0.076 |
| 2511.0 | 0.076 |
| 2512.0 | 0.079 |
| 2513.0 | 0.077 |
| 2514.0 | 0.077 |
| 2515.0 | 0.076 |
| 2516.0 | 0.079 |
| 2517.0 | 0.075 |
| 2518.0 | 0.079 |
| 2519.0 | 0.078 |
| 2520.0 | 0.077 |
| 2521.0 | 0.077 |
| 2522.0 | 0.079 |
| 2523.0 | 0.076 |
| 2524.0 | 0.076 |
| 2525.0 | 0.076 |
| 2526.0 | 0.077 |
| 2527.0 | 0.077 |
| 2528.0 | 0.077 |
| 2529.0 | 0.078 |
| 2530.0 | 0.078 |
| 2531.0 | 0.077 |
| 2532.0 | 0.078 |
| 2533.0 | 0.078 |
| 2534.0 | 0.077 |
| 2535.0 | 0.078 |
| 2536.0 | 0.08 |
| 2537.0 | 0.077 |
| 2538.0 | 0.076 |
| 2539.0 | 0.077 |
| 2540.0 | 0.079 |
| 2541.0 | 0.075 |
| 2542.0 | 0.077 |
| 2543.0 | 0.077 |
| 2544.0 | 0.079 |
| 2545.0 | 0.078 |
| 2546.0 | 0.078 |
| 2547.0 | 0.076 |
| 2548.0 | 0.077 |
| 2549.0 | 0.078 |
| 2550.0 | 0.079 |
| 2551.0 | 0.076 |
| 2552.0 | 0.077 |
| 2553.0 | 0.077 |
| 2554.0 | 0.076 |
| 2555.0 | 0.08 |
| 2556.0 | 0.078 |
| 2557.0 | 0.077 |
| 2558.0 | 0.077 |
| 2559.0 | 0.078 |
| 2560.0 | 0.076 |
| 2561.0 | 0.076 |
| 2562.0 | 0.077 |
| 2563.0 | 0.076 |
| 2564.0 | 0.076 |
| 2565.0 | 0.082 |
| 2566.0 | 0.079 |
| 2567.0 | 0.076 |
| 2568.0 | 0.079 |
| 2569.0 | 0.078 |
| 2570.0 | 0.078 |
| 2571.0 | 0.078 |
| 2572.0 | 0.076 |
| 2573.0 | 0.077 |
| 2574.0 | 0.079 |
| 2575.0 | 0.078 |
| 2576.0 | 0.078 |
| 2577.0 | 0.075 |
| 2578.0 | 0.077 |
| 2579.0 | 0.077 |
| 2580.0 | 0.076 |
| 2581.0 | 0.075 |
| 2582.0 | 0.078 |
| 2583.0 | 0.078 |
| 2584.0 | 0.077 |
| 2585.0 | 0.075 |
| 2586.0 | 0.079 |
| 2587.0 | 0.075 |
| 2588.0 | 0.076 |
| 2589.0 | 0.078 |
| 2590.0 | 0.079 |
| 2591.0 | 0.076 |
| 2592.0 | 0.077 |
| 2593.0 | 0.077 |
| 2594.0 | 0.075 |
| 2595.0 | 0.077 |
| 2596.0 | 0.079 |
| 2597.0 | 0.078 |
| 2598.0 | 0.078 |
| 2599.0 | 0.075 |
| 2600.0 | 0.08 |
| 2601.0 | 0.076 |
| 2602.0 | 0.077 |
| 2603.0 | 0.077 |
| 2604.0 | 0.078 |
| 2605.0 | 0.079 |
| 2606.0 | 0.078 |
| 2607.0 | 0.078 |
| 2608.0 | 0.076 |
| 2609.0 | 0.078 |
| 2610.0 | 0.08 |
| 2611.0 | 0.077 |
| 2612.0 | 0.077 |
| 2613.0 | 0.08 |
| 2614.0 | 0.078 |
| 2615.0 | 0.077 |
| 2616.0 | 0.076 |
| 2617.0 | 0.08 |
| 2618.0 | 0.076 |
| 2619.0 | 0.077 |
| 2620.0 | 0.078 |
| 2621.0 | 0.078 |
| 2622.0 | 0.079 |
| 2623.0 | 0.078 |
| 2624.0 | 0.077 |
| 2625.0 | 0.079 |
| 2626.0 | 0.078 |
| 2627.0 | 0.077 |
| 2628.0 | 0.078 |
| 2629.0 | 0.079 |
| 2630.0 | 0.078 |
| 2631.0 | 0.08 |
| 2632.0 | 0.08 |
| 2633.0 | 0.078 |
| 2634.0 | 0.078 |
| 2635.0 | 0.078 |
| 2636.0 | 0.076 |
| 2637.0 | 0.076 |
| 2638.0 | 0.079 |
| 2639.0 | 0.076 |
| 2640.0 | 0.078 |
| 2641.0 | 0.08 |
| 2642.0 | 0.078 |
| 2643.0 | 0.079 |
| 2644.0 | 0.079 |
| 2645.0 | 0.078 |
| 2646.0 | 0.077 |
| 2647.0 | 0.078 |
| 2648.0 | 0.077 |
| 2649.0 | 0.075 |
| 2650.0 | 0.075 |
| 2651.0 | 0.077 |
| 2652.0 | 0.078 |
| 2653.0 | 0.077 |
| 2654.0 | 0.077 |
| 2655.0 | 0.078 |
| 2656.0 | 0.075 |
| 2657.0 | 0.075 |
| 2658.0 | 0.076 |
| 2659.0 | 0.077 |
| 2660.0 | 0.078 |
| 2661.0 | 0.075 |
| 2662.0 | 0.078 |
| 2663.0 | 0.079 |
| 2664.0 | 0.087 |
| 2665.0 | 0.082 |
| 2666.0 | 0.082 |
| 2667.0 | 0.082 |
| 2668.0 | 0.082 |
| 2669.0 | 0.088 |
| 2670.0 | 0.084 |
| 2671.0 | 0.086 |
| 2672.0 | 0.084 |
| 2673.0 | 0.087 |
| 2674.0 | 0.087 |
| 2675.0 | 0.088 |
| 2676.0 | 0.088 |
| 2677.0 | 0.089 |
| 2678.0 | 0.087 |
| 2679.0 | 0.087 |
| 2680.0 | 0.087 |
| 2681.0 | 0.084 |
| 2682.0 | 0.081 |
| 2683.0 | 0.086 |
| 2684.0 | 0.079 |
| 2685.0 | 0.087 |
| 2686.0 | 0.085 |
| 2687.0 | 0.085 |
| 2688.0 | 0.084 |
| 2689.0 | 0.087 |
| 2690.0 | 0.083 |
| 2691.0 | 0.084 |
| 2692.0 | 0.087 |
| 2693.0 | 0.083 |
| 2694.0 | 0.087 |
| 2695.0 | 0.088 |
| 2696.0 | 0.085 |
| 2697.0 | 0.087 |
| 2698.0 | 0.085 |
| 2699.0 | 0.081 |
| 2700.0 | 0.08 |
| 2701.0 | 0.083 |
| 2702.0 | 0.079 |
| 2703.0 | 0.08 |
| 2704.0 | 0.082 |
| 2705.0 | 0.08 |
| 2706.0 | 0.085 |
| 2707.0 | 0.084 |
| 2708.0 | 0.08 |
| 2709.0 | 0.083 |
| 2710.0 | 0.081 |
| 2711.0 | 0.084 |
| 2712.0 | 0.083 |
| 2713.0 | 0.086 |
| 2714.0 | 0.086 |
| 2715.0 | 0.082 |
| 2716.0 | 0.084 |
| 2717.0 | 0.082 |
| 2718.0 | 0.088 |
| 2719.0 | 0.089 |
| 2720.0 | 0.088 |
| 2721.0 | 0.083 |
| 2722.0 | 0.086 |
| 2723.0 | 0.084 |
| 2724.0 | 0.09 |
| 2725.0 | 0.085 |
| 2726.0 | 0.087 |
| 2727.0 | 0.085 |
| 2728.0 | 0.089 |
| 2729.0 | 0.082 |
| 2730.0 | 0.087 |
| 2731.0 | 0.085 |
| 2732.0 | 0.084 |
| 2733.0 | 0.084 |
| 2734.0 | 0.087 |
| 2735.0 | 0.085 |
| 2736.0 | 0.084 |
| 2737.0 | 0.084 |
| 2738.0 | 0.082 |
| 2739.0 | 0.09 |
| 2740.0 | 0.088 |
| 2741.0 | 0.085 |
| 2742.0 | 0.086 |
| 2743.0 | 0.088 |
| 2744.0 | 0.09 |
| 2745.0 | 0.085 |
| 2746.0 | 0.09 |
| 2747.0 | 0.088 |
| 2748.0 | 0.088 |
| 2749.0 | 0.087 |
| 2750.0 | 0.086 |
| 2751.0 | 0.088 |
| 2752.0 | 0.084 |
| 2753.0 | 0.09 |
| 2754.0 | 0.091 |
| 2755.0 | 0.092 |
| 2756.0 | 0.095 |
| 2757.0 | 0.093 |
| 2758.0 | 0.087 |
| 2759.0 | 0.089 |
| 2760.0 | 0.093 |
| 2761.0 | 0.096 |
| 2762.0 | 0.092 |
| 2763.0 | 0.092 |
| 2764.0 | 0.089 |
| 2765.0 | 0.098 |
| 2766.0 | 0.096 |
| 2767.0 | 0.08 |
| 2768.0 | 0.094 |
| 2769.0 | 0.09 |
| 2770.0 | 0.092 |
| 2771.0 | 0.096 |
| 2772.0 | 0.091 |
| 2773.0 | 0.095 |
| 2774.0 | 0.085 |
| 2775.0 | 0.09 |
| 2776.0 | 0.091 |
| 2777.0 | 0.083 |
| 2778.0 | 0.09 |
| 2779.0 | 0.084 |
| 2780.0 | 0.091 |
| 2781.0 | 0.088 |
| 2782.0 | 0.087 |
| 2783.0 | 0.086 |
| 2784.0 | 0.084 |
| 2785.0 | 0.084 |
| 2786.0 | 0.087 |
| 2787.0 | 0.084 |
| 2788.0 | 0.085 |
| 2789.0 | 0.084 |
| 2790.0 | 0.084 |
| 2791.0 | 0.087 |
| 2792.0 | 0.086 |
| 2793.0 | 0.087 |
| 2794.0 | 0.091 |
| 2795.0 | 0.084 |
| 2796.0 | 0.087 |
| 2797.0 | 0.081 |
| 2798.0 | 0.081 |
| 2799.0 | 0.081 |
| 2800.0 | 0.089 |
| 2801.0 | 0.082 |
| 2802.0 | 0.083 |
| 2803.0 | 0.082 |
| 2804.0 | 0.088 |
| 2805.0 | 0.081 |
| 2806.0 | 0.086 |
| 2807.0 | 0.086 |
| 2808.0 | 0.083 |
| 2809.0 | 0.085 |
| 2810.0 | 0.078 |
| 2811.0 | 0.083 |
| 2812.0 | 0.085 |
| 2813.0 | 0.084 |
| 2814.0 | 0.074 |
| 2815.0 | 0.083 |
| 2816.0 | 0.084 |
| 2817.0 | 0.081 |
| 2818.0 | 0.078 |
| 2819.0 | 0.08 |
| 2820.0 | 0.082 |
| 2821.0 | 0.079 |
| 2822.0 | 0.08 |
| 2823.0 | 0.08 |
| 2824.0 | 0.084 |
| 2825.0 | 0.082 |
| 2826.0 | 0.08 |
| 2827.0 | 0.081 |
| 2828.0 | 0.08 |
| 2829.0 | 0.078 |
| 2830.0 | 0.083 |
| 2831.0 | 0.083 |
| 2832.0 | 0.079 |
| 2833.0 | 0.081 |
| 2834.0 | 0.081 |
| 2835.0 | 0.08 |
| 2836.0 | 0.08 |
| 2837.0 | 0.081 |
| 2838.0 | 0.083 |
| 2839.0 | 0.08 |
| 2840.0 | 0.083 |
| 2841.0 | 0.08 |
| 2842.0 | 0.085 |
| 2843.0 | 0.085 |
| 2844.0 | 0.084 |
| 2845.0 | 0.083 |
| 2846.0 | 0.087 |
| 2847.0 | 0.079 |
| 2848.0 | 0.082 |
| 2849.0 | 0.083 |
| 2850.0 | 0.082 |
| 2851.0 | 0.081 |
| 2852.0 | 0.077 |
| 2853.0 | 0.082 |
| 2854.0 | 0.083 |
| 2855.0 | 0.085 |
| 2856.0 | 0.081 |
| 2857.0 | 0.083 |
| 2858.0 | 0.084 |
| 2859.0 | 0.086 |
| 2860.0 | 0.083 |
| 2861.0 | 0.085 |
| 2862.0 | 0.086 |
| 2863.0 | 0.082 |
| 2864.0 | 0.082 |
| 2865.0 | 0.08 |
| 2866.0 | 0.081 |
| 2867.0 | 0.081 |
| 2868.0 | 0.084 |
| 2869.0 | 0.081 |
| 2870.0 | 0.081 |
| 2871.0 | 0.084 |
| 2872.0 | 0.082 |
| 2873.0 | 0.083 |
| 2874.0 | 0.085 |
| 2875.0 | 0.083 |
| 2876.0 | 0.083 |
| 2877.0 | 0.082 |
| 2878.0 | 0.085 |
| 2879.0 | 0.084 |
| 2880.0 | 0.082 |
| 2881.0 | 0.084 |
| 2882.0 | 0.084 |
| 2883.0 | 0.086 |
| 2884.0 | 0.083 |
| 2885.0 | 0.088 |
| 2886.0 | 0.089 |
| 2887.0 | 0.083 |
| 2888.0 | 0.084 |
| 2889.0 | 0.085 |
| 2890.0 | 0.085 |
| 2891.0 | 0.088 |
| 2892.0 | 0.087 |
| 2893.0 | 0.087 |
| 2894.0 | 0.086 |
| 2895.0 | 0.085 |
| 2896.0 | 0.087 |
| 2897.0 | 0.09 |
| 2898.0 | 0.081 |
| 2899.0 | 0.088 |
| 2900.0 | 0.088 |
| 2901.0 | 0.088 |
| 2902.0 | 0.09 |
| 2903.0 | 0.08 |
| 2904.0 | 0.091 |
| 2905.0 | 0.093 |
| 2906.0 | 0.089 |
| 2907.0 | 0.087 |
| 2908.0 | 0.091 |
| 2909.0 | 0.092 |
| 2910.0 | 0.09 |
| 2911.0 | 0.092 |
| 2912.0 | 0.084 |
| 2913.0 | 0.094 |
| 2914.0 | 0.088 |
| 2915.0 | 0.092 |
| 2916.0 | 0.092 |
| 2917.0 | 0.091 |
| 2918.0 | 0.088 |
| 2919.0 | 0.092 |
| 2920.0 | 0.093 |
| 2921.0 | 0.085 |
| 2922.0 | 0.094 |
| 2923.0 | 0.095 |
| 2924.0 | 0.091 |
| 2925.0 | 0.095 |
| 2926.0 | 0.092 |
| 2927.0 | 0.092 |
| 2928.0 | 0.097 |
| 2929.0 | 0.09 |
| 2930.0 | 0.091 |
| 2931.0 | 0.091 |
| 2932.0 | 0.095 |
| 2933.0 | 0.092 |
| 2934.0 | 0.095 |
| 2935.0 | 0.094 |
| 2936.0 | 0.092 |
| 2937.0 | 0.096 |
| 2938.0 | 0.095 |
| 2939.0 | 0.098 |
| 2940.0 | 0.097 |
| 2941.0 | 0.097 |
| 2942.0 | 0.098 |
| 2943.0 | 0.098 |
| 2944.0 | 0.096 |
| 2945.0 | 0.094 |
| 2946.0 | 0.099 |
| 2947.0 | 0.097 |
| 2948.0 | 0.088 |
| 2949.0 | 0.1 |
| 2950.0 | 0.1 |
| 2951.0 | 0.09 |
| 2952.0 | 0.095 |
| 2953.0 | 0.103 |
| 2954.0 | 0.101 |
| 2955.0 | 0.096 |
| 2956.0 | 0.103 |
| 2957.0 | 0.105 |
| 2958.0 | 0.104 |
| 2959.0 | 0.1 |
| 2960.0 | 0.1 |
| 2961.0 | 0.099 |
| 2962.0 | 0.102 |
| 2963.0 | 0.102 |
| 2964.0 | 0.106 |
| 2965.0 | 0.094 |
| 2966.0 | 0.105 |
| 2967.0 | 0.099 |
| 2968.0 | 0.103 |
| 2969.0 | 0.103 |
| 2970.0 | 0.117 |
| 2971.0 | 0.112 |
| 2972.0 | 0.115 |
| 2973.0 | 0.112 |
| 2974.0 | 0.1 |
| 2975.0 | 0.115 |
| 2976.0 | 0.113 |
| 2977.0 | 0.105 |
| 2978.0 | 0.12 |
| 2979.0 | 0.112 |
| 2980.0 | 0.108 |
| 2981.0 | 0.108 |
| 2982.0 | 0.104 |
| 2983.0 | 0.112 |
| 2984.0 | 0.118 |
| 2985.0 | 0.115 |
| 2986.0 | 0.12 |
| 2987.0 | 0.106 |
| 2988.0 | 0.116 |
| 2989.0 | 0.117 |
| 2990.0 | 0.107 |
| 2991.0 | 0.108 |
| 2992.0 | 0.126 |
| 2993.0 | 0.127 |
| 2994.0 | 0.119 |
| 2995.0 | 0.118 |
| 2996.0 | 0.118 |
| 2997.0 | 0.126 |
| 2998.0 | 0.124 |
| 2999.0 | 0.12 |
| 3000.0 | 0.116 |
| 3001.0 | 0.124 |
| 3002.0 | 0.137 |
| 3003.0 | 0.146 |
| 3004.0 | 0.123 |
| 3005.0 | 0.132 |
| 3006.0 | 0.127 |
| 3007.0 | 0.136 |
| 3008.0 | 0.115 |
| 3009.0 | 0.138 |
| 3010.0 | 0.13 |
| 3011.0 | 0.136 |
| 3012.0 | 0.13 |
| 3013.0 | 0.128 |
| 3014.0 | 0.121 |
| 3015.0 | 0.131 |
| 3016.0 | 0.125 |
| 3017.0 | 0.138 |
| 3018.0 | 0.14 |
| 3019.0 | 0.121 |
| 3020.0 | 0.132 |
| 3021.0 | 0.15 |
| 3022.0 | 0.139 |
| 3023.0 | 0.143 |
| 3024.0 | 0.152 |
| 3025.0 | 0.15 |
| 3026.0 | 0.135 |
| 3027.0 | 0.15 |
| 3028.0 | 0.132 |
| 3029.0 | 0.144 |
| 3030.0 | 0.128 |
| 3031.0 | 0.14 |
| 3032.0 | 0.145 |
| 3033.0 | 0.138 |
| 3034.0 | 0.155 |
| 3035.0 | 0.137 |
| 3036.0 | 0.138 |
| 3037.0 | 0.162 |
| 3038.0 | 0.15 |
| 3039.0 | 0.137 |
| 3040.0 | 0.153 |
| 3041.0 | 0.162 |
| 3042.0 | 0.162 |
| 3043.0 | 0.156 |
| 3044.0 | 0.186 |
| 3045.0 | 0.155 |
| 3046.0 | 0.164 |
| 3047.0 | 0.157 |
| 3048.0 | 0.177 |
| 3049.0 | 0.169 |
| 3050.0 | 0.18 |
| 3051.0 | 0.169 |
| 3052.0 | 0.18 |
| 3053.0 | 0.174 |
| 3054.0 | 0.192 |
| 3055.0 | 0.168 |
| 3056.0 | 0.194 |
| 3057.0 | 0.169 |
| 3058.0 | 0.185 |
| 3059.0 | 0.177 |
| 3060.0 | 0.183 |
| 3061.0 | 0.155 |
| 3062.0 | 0.179 |
| 3063.0 | 0.157 |
| 3064.0 | 0.161 |
| 3065.0 | 0.201 |
| 3066.0 | 0.179 |
| 3067.0 | 0.186 |
| 3068.0 | 0.215 |
| 3069.0 | 0.205 |
| 3070.0 | 0.201 |
| 3071.0 | 0.22 |
| 3072.0 | 0.209 |
| 3073.0 | 0.195 |
| 3074.0 | 0.207 |
| 3075.0 | 0.202 |
| 3076.0 | 0.208 |
| 3077.0 | 0.211 |
| 3078.0 | 0.174 |
| 3079.0 | 0.201 |
| 3080.0 | 0.183 |
| 3081.0 | 0.194 |
| 3082.0 | 0.184 |
| 3083.0 | 0.175 |
| 3084.0 | 0.22 |
| 3085.0 | 0.176 |
| 3086.0 | 0.222 |
| 3087.0 | 0.208 |
| 3088.0 | 0.192 |
| 3089.0 | 0.24 |
| 3090.0 | 0.238 |
| 3091.0 | 0.23 |
| 3092.0 | 0.229 |
| 3093.0 | 0.219 |
| 3094.0 | 0.234 |
| 3095.0 | 0.256 |
| 3096.0 | 0.218 |
| 3097.0 | 0.218 |
| 3098.0 | 0.251 |
| 3099.0 | 0.27 |
| 3100.0 | 0.228 |
| 3101.0 | 0.283 |
| 3102.0 | 0.22 |
| 3103.0 | 0.288 |
| 3104.0 | 0.269 |
| 3105.0 | 0.269 |
| 3106.0 | 0.272 |
| 3107.0 | 0.257 |
| 3108.0 | 0.206 |
| 3109.0 | 0.25 |
| 3110.0 | 0.255 |
| 3111.0 | 0.267 |
| 3112.0 | 0.317 |
| 3113.0 | 0.298 |
| 3114.0 | 0.308 |
| 3115.0 | 0.29 |
| 3116.0 | 0.326 |
| 3117.0 | 0.339 |
| 3118.0 | 0.33 |
| 3119.0 | 0.302 |
| 3120.0 | 0.294 |
| 3121.0 | 0.256 |
| 3122.0 | 0.318 |
| 3123.0 | 0.302 |
| 3124.0 | 0.317 |
| 3125.0 | 0.314 |
| 3126.0 | 0.341 |
| 3127.0 | 0.356 |
| 3128.0 | 0.332 |
| 3129.0 | 0.411 |
| 3130.0 | 0.34 |
| 3131.0 | 0.302 |
| 3132.0 | 0.274 |
| 3133.0 | 0.298 |
| 3134.0 | 0.335 |
| 3135.0 | 0.338 |
| 3136.0 | 0.343 |
| 3137.0 | 0.328 |
| 3138.0 | 0.338 |
| 3139.0 | 0.371 |
| 3140.0 | 0.354 |
| 3141.0 | 0.347 |
| 3142.0 | 0.29 |
| 3143.0 | 0.35 |
| 3144.0 | 0.267 |
| 3145.0 | 0.386 |
| 3146.0 | 0.364 |
| 3147.0 | 0.376 |
| 3148.0 | 0.429 |
| 3149.0 | 0.39 |
| 3150.0 | 0.426 |
| 3151.0 | 0.407 |
| 3152.0 | 0.322 |
| 3153.0 | 0.431 |
| 3154.0 | 0.404 |
| 3155.0 | 0.435 |
| 3156.0 | 0.394 |
| 3157.0 | 0.443 |
| 3158.0 | 0.443 |
| 3159.0 | 0.479 |
| 3160.0 | 0.48 |
| 3161.0 | 0.454 |
| 3162.0 | 0.473 |
| 3163.0 | 0.435 |
| 3164.0 | 0.415 |
| 3165.0 | 0.404 |
| 3166.0 | 0.488 |
| 3167.0 | 0.572 |
| 3168.0 | 0.501 |
| 3169.0 | 0.471 |
| 3170.0 | 0.461 |
| 3171.0 | 0.43 |
| 3172.0 | 0.543 |
| 3173.0 | 0.458 |
| 3174.0 | 0.546 |
| 3175.0 | 0.494 |
| 3176.0 | 0.528 |
| 3177.0 | 0.553 |
| 3178.0 | 0.433 |
| 3179.0 | 0.574 |
| 3180.0 | 0.572 |
| 3181.0 | 0.605 |
| 3182.0 | 0.626 |
| 3183.0 | 0.594 |
| 3184.0 | 0.583 |
| 3185.0 | 0.573 |
| 3186.0 | 0.517 |
| 3187.0 | 0.654 |
| 3188.0 | 0.614 |
| 3189.0 | 0.659 |
| 3190.0 | 0.786 |
| 3191.0 | 0.635 |
| 3192.0 | 0.564 |
| 3193.0 | 0.625 |
| 3194.0 | 0.678 |
| 3195.0 | 0.681 |
| 3196.0 | 0.695 |
| 3197.0 | 0.724 |
| 3198.0 | 0.734 |
| 3199.0 | 0.762 |
| 3200.0 | 0.754 |
| 3201.0 | 0.854 |
| 3202.0 | 0.624 |
| 3203.0 | 0.752 |
| 3204.0 | 0.765 |
| 3205.0 | 0.748 |
| 3206.0 | 0.85 |
| 3207.0 | 0.768 |
| 3208.0 | 0.897 |
| 3209.0 | 0.722 |
| 3210.0 | 0.791 |
| 3211.0 | 0.84 |
| 3212.0 | 0.932 |
| 3213.0 | 0.797 |
| 3214.0 | 0.845 |
| 3215.0 | 0.91 |
| 3216.0 | 0.839 |
| 3217.0 | 0.873 |
| 3218.0 | 0.84 |
| 3219.0 | 0.985 |
| 3220.0 | 0.928 |
| 3221.0 | 0.867 |
| 3222.0 | 1.002 |
| 3223.0 | 0.949 |
| 3224.0 | 0.883 |
| 3225.0 | 1.061 |
| 3226.0 | 0.981 |
| 3227.0 | 1.025 |
| 3228.0 | 1 |
| 3229.0 | 1.127 |
| 3230.0 | 1.182 |
| 3231.0 | 1.18 |
| 3232.0 | 0.752 |
| 3233.0 | 1.139 |
| 3234.0 | 1.012 |
| 3235.0 | 1.014 |
| 3236.0 | 1.047 |
| 3237.0 | 0.958 |
| 3238.0 | 1.089 |
| 3239.0 | 1.272 |
| 3240.0 | 1.225 |
| 3241.0 | 1.17 |
| 3242.0 | 1.112 |
| 3243.0 | 1.17 |
| 3244.0 | 1.228 |
| 3245.0 | 1.088 |
| 3246.0 | 1.01 |
| 3247.0 | 1.305 |
| 3248.0 | 1.167 |
| 3249.0 | 1.165 |
| 3250.0 | 1.363 |
| 3251.0 | 1.285 |
| 3252.0 | 1.179 |
| 3253.0 | 1.091 |
| 3254.0 | 1.172 |
| 3255.0 | 1.334 |
| 3256.0 | 1.22 |
| 3257.0 | 1.414 |
| 3258.0 | 1.384 |
| 3259.0 | 1.232 |
| 3260.0 | 1.209 |
| 3261.0 | 1.309 |
| 3262.0 | 1.433 |
| 3263.0 | 1.441 |
| 3264.0 | 1.581 |
| 3265.0 | 1.367 |
| 3266.0 | 1.562 |
| 3267.0 | 1.304 |
| 3268.0 | 1.522 |
| 3269.0 | 1.756 |
| 3270.0 | 1.735 |
| 3271.0 | 1.573 |
| 3272.0 | 1.547 |
| 3273.0 | 1.81 |
| 3274.0 | 1.571 |
| 3275.0 | 1.884 |
| 3276.0 | 1.801 |
| 3277.0 | 1.73 |
| 3278.0 | 1.855 |
| 3279.0 | 1.653 |
| 3280.0 | 1.631 |
| 3281.0 | 1.784 |
| 3282.0 | 1.581 |
| 3283.0 | 1.673 |
| 3284.0 | 1.884 |
| 3285.0 | 1.748 |
| 3286.0 | 2.075 |
| 3287.0 | 1.857 |
| 3288.0 | 2.091 |
| 3289.0 | 1.523 |
| 3290.0 | 1.816 |
| 3291.0 | 1.74 |
| 3292.0 | 1.813 |
| 3293.0 | 2.078 |
| 3294.0 | 1.73 |
| 3295.0 | 2.046 |
| 3296.0 | 1.865 |
| 3297.0 | 1.798 |
| 3298.0 | 1.971 |
| 3299.0 | 2.237 |
| 3300.0 | 2.408 |